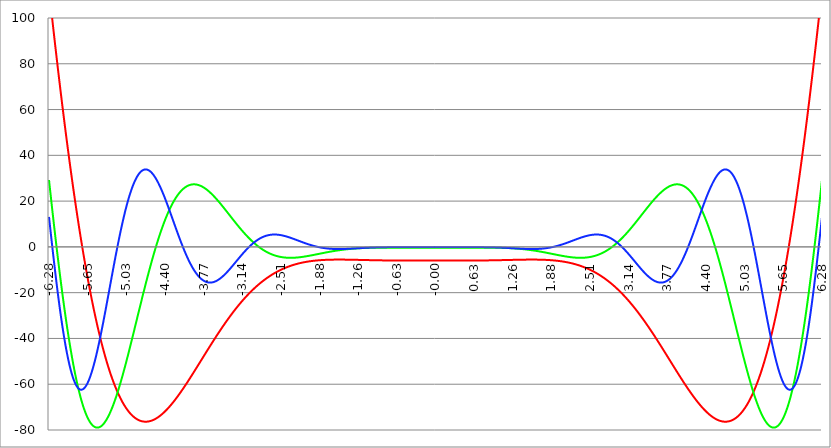
| Category | Series 1 | Series 0 | Series 2 |
|---|---|---|---|
| -6.283185307179586 | 112.435 | 29.234 | 13.085 |
| -6.276902121872407 | 110.879 | 27.678 | 11.529 |
| -6.270618936565228 | 109.328 | 26.126 | 9.978 |
| -6.264335751258049 | 107.781 | 24.58 | 8.433 |
| -6.25805256595087 | 106.239 | 23.04 | 6.894 |
| -6.25176938064369 | 104.702 | 21.504 | 5.362 |
| -6.245486195336511 | 103.17 | 19.975 | 3.838 |
| -6.23920301002933 | 101.643 | 18.452 | 2.321 |
| -6.232919824722153 | 100.121 | 16.935 | 0.812 |
| -6.226636639414973 | 98.604 | 15.424 | -0.687 |
| -6.220353454107794 | 97.092 | 13.921 | -2.178 |
| -6.214070268800615 | 95.585 | 12.424 | -3.658 |
| -6.207787083493435 | 94.084 | 10.934 | -5.128 |
| -6.201503898186257 | 92.588 | 9.452 | -6.588 |
| -6.195220712879077 | 91.097 | 7.977 | -8.036 |
| -6.188937527571898 | 89.611 | 6.51 | -9.472 |
| -6.182654342264719 | 88.131 | 5.051 | -10.896 |
| -6.17637115695754 | 86.656 | 3.6 | -12.308 |
| -6.170087971650361 | 85.187 | 2.157 | -13.706 |
| -6.163804786343182 | 83.724 | 0.724 | -15.091 |
| -6.157521601036002 | 82.265 | -0.702 | -16.462 |
| -6.151238415728823 | 80.813 | -2.118 | -17.819 |
| -6.144955230421644 | 79.366 | -3.525 | -19.161 |
| -6.138672045114464 | 77.925 | -4.923 | -20.487 |
| -6.132388859807286 | 76.489 | -6.312 | -21.798 |
| -6.126105674500106 | 75.06 | -7.69 | -23.094 |
| -6.119822489192927 | 73.636 | -9.059 | -24.373 |
| -6.113539303885748 | 72.218 | -10.418 | -25.635 |
| -6.107256118578569 | 70.806 | -11.767 | -26.88 |
| -6.10097293327139 | 69.4 | -13.105 | -28.108 |
| -6.09468974796421 | 67.999 | -14.433 | -29.318 |
| -6.088406562657031 | 66.605 | -15.75 | -30.51 |
| -6.082123377349852 | 65.217 | -17.057 | -31.683 |
| -6.075840192042672 | 63.835 | -18.352 | -32.838 |
| -6.069557006735494 | 62.459 | -19.636 | -33.974 |
| -6.063273821428314 | 61.089 | -20.909 | -35.09 |
| -6.056990636121135 | 59.725 | -22.171 | -36.187 |
| -6.050707450813956 | 58.368 | -23.421 | -37.264 |
| -6.044424265506777 | 57.016 | -24.659 | -38.32 |
| -6.038141080199597 | 55.671 | -25.885 | -39.357 |
| -6.031857894892418 | 54.332 | -27.1 | -40.372 |
| -6.025574709585239 | 53 | -28.302 | -41.367 |
| -6.01929152427806 | 51.674 | -29.492 | -42.34 |
| -6.013008338970881 | 50.354 | -30.669 | -43.293 |
| -6.006725153663701 | 49.041 | -31.835 | -44.223 |
| -6.000441968356522 | 47.734 | -32.987 | -45.132 |
| -5.994158783049343 | 46.434 | -34.127 | -46.018 |
| -5.987875597742164 | 45.14 | -35.254 | -46.883 |
| -5.981592412434984 | 43.853 | -36.368 | -47.725 |
| -5.975309227127805 | 42.572 | -37.469 | -48.545 |
| -5.969026041820626 | 41.298 | -38.556 | -49.341 |
| -5.962742856513447 | 40.03 | -39.631 | -50.115 |
| -5.956459671206268 | 38.769 | -40.692 | -50.866 |
| -5.950176485899088 | 37.515 | -41.739 | -51.594 |
| -5.94389330059191 | 36.268 | -42.773 | -52.299 |
| -5.93761011528473 | 35.027 | -43.793 | -52.98 |
| -5.931326929977551 | 33.793 | -44.8 | -53.638 |
| -5.925043744670372 | 32.565 | -45.793 | -54.272 |
| -5.918760559363193 | 31.345 | -46.771 | -54.883 |
| -5.912477374056014 | 30.131 | -47.736 | -55.47 |
| -5.906194188748834 | 28.924 | -48.687 | -56.033 |
| -5.899911003441655 | 27.724 | -49.624 | -56.572 |
| -5.893627818134476 | 26.53 | -50.546 | -57.087 |
| -5.887344632827297 | 25.344 | -51.454 | -57.579 |
| -5.881061447520117 | 24.164 | -52.348 | -58.046 |
| -5.874778262212938 | 22.992 | -53.227 | -58.49 |
| -5.868495076905759 | 21.826 | -54.092 | -58.909 |
| -5.86221189159858 | 20.667 | -54.942 | -59.305 |
| -5.855928706291401 | 19.515 | -55.778 | -59.676 |
| -5.849645520984221 | 18.371 | -56.599 | -60.024 |
| -5.843362335677042 | 17.233 | -57.405 | -60.348 |
| -5.837079150369863 | 16.102 | -58.197 | -60.648 |
| -5.830795965062684 | 14.978 | -58.974 | -60.924 |
| -5.824512779755505 | 13.861 | -59.736 | -61.176 |
| -5.818229594448325 | 12.752 | -60.484 | -61.404 |
| -5.811946409141146 | 11.649 | -61.216 | -61.609 |
| -5.805663223833967 | 10.554 | -61.934 | -61.79 |
| -5.799380038526788 | 9.465 | -62.636 | -61.948 |
| -5.793096853219609 | 8.384 | -63.324 | -62.082 |
| -5.78681366791243 | 7.31 | -63.997 | -62.193 |
| -5.780530482605251 | 6.243 | -64.655 | -62.281 |
| -5.774247297298071 | 5.183 | -65.297 | -62.345 |
| -5.767964111990892 | 4.13 | -65.925 | -62.387 |
| -5.761680926683713 | 3.084 | -66.538 | -62.406 |
| -5.755397741376534 | 2.046 | -67.136 | -62.402 |
| -5.749114556069355 | 1.014 | -67.718 | -62.376 |
| -5.742831370762175 | -0.01 | -68.286 | -62.327 |
| -5.736548185454996 | -1.026 | -68.839 | -62.257 |
| -5.730265000147816 | -2.036 | -69.376 | -62.164 |
| -5.723981814840638 | -3.039 | -69.899 | -62.049 |
| -5.717698629533459 | -4.034 | -70.407 | -61.912 |
| -5.711415444226279 | -5.022 | -70.899 | -61.755 |
| -5.7051322589191 | -6.003 | -71.377 | -61.575 |
| -5.698849073611921 | -6.976 | -71.839 | -61.375 |
| -5.692565888304742 | -7.943 | -72.287 | -61.154 |
| -5.686282702997562 | -8.902 | -72.72 | -60.912 |
| -5.679999517690383 | -9.854 | -73.137 | -60.65 |
| -5.673716332383204 | -10.798 | -73.54 | -60.368 |
| -5.667433147076025 | -11.735 | -73.928 | -60.065 |
| -5.661149961768846 | -12.666 | -74.302 | -59.743 |
| -5.654866776461667 | -13.588 | -74.66 | -59.402 |
| -5.648583591154487 | -14.504 | -75.004 | -59.041 |
| -5.642300405847308 | -15.412 | -75.333 | -58.662 |
| -5.63601722054013 | -16.313 | -75.647 | -58.263 |
| -5.62973403523295 | -17.207 | -75.947 | -57.847 |
| -5.623450849925771 | -18.094 | -76.232 | -57.412 |
| -5.617167664618591 | -18.973 | -76.503 | -56.959 |
| -5.610884479311412 | -19.845 | -76.759 | -56.489 |
| -5.604601294004233 | -20.709 | -77.001 | -56.002 |
| -5.598318108697054 | -21.567 | -77.228 | -55.497 |
| -5.592034923389875 | -22.417 | -77.441 | -54.976 |
| -5.585751738082695 | -23.26 | -77.64 | -54.439 |
| -5.579468552775516 | -24.096 | -77.824 | -53.885 |
| -5.573185367468337 | -24.924 | -77.995 | -53.316 |
| -5.566902182161157 | -25.745 | -78.151 | -52.731 |
| -5.560618996853979 | -26.559 | -78.294 | -52.132 |
| -5.5543358115468 | -27.366 | -78.422 | -51.517 |
| -5.54805262623962 | -28.166 | -78.537 | -50.888 |
| -5.54176944093244 | -28.958 | -78.637 | -50.245 |
| -5.535486255625262 | -29.743 | -78.724 | -49.588 |
| -5.529203070318083 | -30.521 | -78.798 | -48.918 |
| -5.522919885010904 | -31.292 | -78.858 | -48.234 |
| -5.516636699703724 | -32.055 | -78.904 | -47.538 |
| -5.510353514396545 | -32.811 | -78.937 | -46.829 |
| -5.504070329089366 | -33.56 | -78.957 | -46.108 |
| -5.497787143782186 | -34.302 | -78.964 | -45.376 |
| -5.491503958475008 | -35.037 | -78.957 | -44.632 |
| -5.485220773167828 | -35.764 | -78.938 | -43.877 |
| -5.47893758786065 | -36.485 | -78.905 | -43.111 |
| -5.47265440255347 | -37.198 | -78.86 | -42.335 |
| -5.466371217246291 | -37.904 | -78.802 | -41.549 |
| -5.460088031939112 | -38.603 | -78.731 | -40.754 |
| -5.453804846631932 | -39.295 | -78.648 | -39.949 |
| -5.447521661324753 | -39.98 | -78.552 | -39.135 |
| -5.441238476017574 | -40.658 | -78.444 | -38.313 |
| -5.434955290710395 | -41.328 | -78.323 | -37.483 |
| -5.428672105403215 | -41.992 | -78.191 | -36.645 |
| -5.422388920096036 | -42.648 | -78.046 | -35.799 |
| -5.416105734788857 | -43.298 | -77.89 | -34.946 |
| -5.409822549481678 | -43.94 | -77.722 | -34.087 |
| -5.403539364174499 | -44.575 | -77.542 | -33.222 |
| -5.39725617886732 | -45.204 | -77.35 | -32.35 |
| -5.39097299356014 | -45.825 | -77.147 | -31.473 |
| -5.384689808252961 | -46.44 | -76.933 | -30.59 |
| -5.378406622945782 | -47.047 | -76.707 | -29.703 |
| -5.372123437638603 | -47.648 | -76.471 | -28.811 |
| -5.365840252331424 | -48.241 | -76.223 | -27.915 |
| -5.359557067024244 | -48.828 | -75.964 | -27.015 |
| -5.353273881717065 | -49.408 | -75.695 | -26.112 |
| -5.346990696409886 | -49.981 | -75.415 | -25.205 |
| -5.340707511102707 | -50.547 | -75.124 | -24.296 |
| -5.334424325795528 | -51.106 | -74.823 | -23.385 |
| -5.328141140488348 | -51.658 | -74.512 | -22.472 |
| -5.32185795518117 | -52.204 | -74.191 | -21.557 |
| -5.31557476987399 | -52.742 | -73.859 | -20.64 |
| -5.30929158456681 | -53.274 | -73.518 | -19.723 |
| -5.303008399259631 | -53.799 | -73.167 | -18.805 |
| -5.296725213952453 | -54.318 | -72.806 | -17.887 |
| -5.290442028645273 | -54.83 | -72.436 | -16.968 |
| -5.284158843338094 | -55.335 | -72.057 | -16.051 |
| -5.277875658030915 | -55.833 | -71.668 | -15.134 |
| -5.271592472723735 | -56.325 | -71.27 | -14.218 |
| -5.265309287416557 | -56.81 | -70.863 | -13.303 |
| -5.259026102109377 | -57.288 | -70.448 | -12.391 |
| -5.252742916802198 | -57.76 | -70.023 | -11.48 |
| -5.246459731495019 | -58.225 | -69.591 | -10.572 |
| -5.24017654618784 | -58.683 | -69.149 | -9.666 |
| -5.23389336088066 | -59.135 | -68.7 | -8.764 |
| -5.227610175573481 | -59.581 | -68.242 | -7.865 |
| -5.221326990266302 | -60.02 | -67.776 | -6.969 |
| -5.215043804959122 | -60.453 | -67.303 | -6.078 |
| -5.208760619651944 | -60.879 | -66.821 | -5.191 |
| -5.202477434344764 | -61.298 | -66.332 | -4.308 |
| -5.196194249037585 | -61.712 | -65.836 | -3.43 |
| -5.189911063730406 | -62.118 | -65.332 | -2.558 |
| -5.183627878423227 | -62.519 | -64.821 | -1.69 |
| -5.177344693116048 | -62.913 | -64.303 | -0.829 |
| -5.171061507808868 | -63.301 | -63.779 | 0.026 |
| -5.164778322501689 | -63.682 | -63.247 | 0.876 |
| -5.15849513719451 | -64.058 | -62.709 | 1.718 |
| -5.152211951887331 | -64.427 | -62.164 | 2.554 |
| -5.145928766580152 | -64.789 | -61.614 | 3.383 |
| -5.139645581272972 | -65.146 | -61.056 | 4.204 |
| -5.133362395965793 | -65.496 | -60.493 | 5.018 |
| -5.127079210658614 | -65.841 | -59.924 | 5.824 |
| -5.120796025351435 | -66.179 | -59.35 | 6.622 |
| -5.114512840044256 | -66.511 | -58.769 | 7.412 |
| -5.108229654737076 | -66.837 | -58.183 | 8.193 |
| -5.101946469429897 | -67.157 | -57.592 | 8.965 |
| -5.095663284122718 | -67.471 | -56.996 | 9.728 |
| -5.08938009881554 | -67.778 | -56.395 | 10.483 |
| -5.08309691350836 | -68.08 | -55.789 | 11.227 |
| -5.07681372820118 | -68.376 | -55.178 | 11.962 |
| -5.070530542894002 | -68.666 | -54.562 | 12.688 |
| -5.064247357586822 | -68.951 | -53.942 | 13.403 |
| -5.057964172279643 | -69.229 | -53.318 | 14.108 |
| -5.051680986972464 | -69.501 | -52.689 | 14.802 |
| -5.045397801665285 | -69.768 | -52.057 | 15.486 |
| -5.039114616358106 | -70.029 | -51.42 | 16.16 |
| -5.032831431050926 | -70.284 | -50.78 | 16.822 |
| -5.026548245743747 | -70.534 | -50.136 | 17.473 |
| -5.020265060436568 | -70.777 | -49.489 | 18.113 |
| -5.013981875129389 | -71.016 | -48.838 | 18.741 |
| -5.00769868982221 | -71.248 | -48.184 | 19.358 |
| -5.00141550451503 | -71.475 | -47.528 | 19.964 |
| -4.995132319207851 | -71.696 | -46.868 | 20.557 |
| -4.98884913390067 | -71.912 | -46.205 | 21.138 |
| -4.982565948593493 | -72.122 | -45.54 | 21.708 |
| -4.976282763286313 | -72.327 | -44.872 | 22.265 |
| -4.969999577979134 | -72.526 | -44.202 | 22.81 |
| -4.963716392671955 | -72.72 | -43.53 | 23.342 |
| -4.957433207364776 | -72.908 | -42.856 | 23.862 |
| -4.951150022057597 | -73.091 | -42.179 | 24.369 |
| -4.944866836750418 | -73.269 | -41.501 | 24.863 |
| -4.938583651443238 | -73.441 | -40.821 | 25.344 |
| -4.932300466136059 | -73.608 | -40.14 | 25.813 |
| -4.92601728082888 | -73.77 | -39.457 | 26.269 |
| -4.9197340955217 | -73.927 | -38.773 | 26.711 |
| -4.913450910214521 | -74.078 | -38.087 | 27.14 |
| -4.907167724907342 | -74.224 | -37.401 | 27.557 |
| -4.900884539600163 | -74.366 | -36.714 | 27.96 |
| -4.894601354292984 | -74.502 | -36.026 | 28.349 |
| -4.888318168985805 | -74.633 | -35.337 | 28.726 |
| -4.882034983678625 | -74.759 | -34.648 | 29.088 |
| -4.875751798371446 | -74.879 | -33.958 | 29.438 |
| -4.869468613064267 | -74.995 | -33.268 | 29.774 |
| -4.863185427757088 | -75.106 | -32.578 | 30.097 |
| -4.856902242449909 | -75.213 | -31.888 | 30.406 |
| -4.85061905714273 | -75.314 | -31.198 | 30.702 |
| -4.84433587183555 | -75.41 | -30.509 | 30.984 |
| -4.838052686528371 | -75.502 | -29.819 | 31.252 |
| -4.831769501221192 | -75.589 | -29.13 | 31.508 |
| -4.825486315914013 | -75.671 | -28.442 | 31.749 |
| -4.819203130606833 | -75.748 | -27.754 | 31.978 |
| -4.812919945299654 | -75.821 | -27.067 | 32.192 |
| -4.806636759992475 | -75.889 | -26.382 | 32.394 |
| -4.800353574685296 | -75.952 | -25.697 | 32.582 |
| -4.794070389378117 | -76.011 | -25.013 | 32.756 |
| -4.787787204070938 | -76.065 | -24.331 | 32.918 |
| -4.781504018763758 | -76.115 | -23.649 | 33.066 |
| -4.77522083345658 | -76.16 | -22.97 | 33.2 |
| -4.7689376481494 | -76.201 | -22.292 | 33.322 |
| -4.762654462842221 | -76.237 | -21.616 | 33.431 |
| -4.756371277535042 | -76.269 | -20.941 | 33.526 |
| -4.750088092227862 | -76.296 | -20.269 | 33.608 |
| -4.743804906920683 | -76.32 | -19.598 | 33.678 |
| -4.737521721613504 | -76.338 | -18.93 | 33.735 |
| -4.731238536306324 | -76.353 | -18.264 | 33.779 |
| -4.724955350999146 | -76.364 | -17.6 | 33.81 |
| -4.718672165691966 | -76.37 | -16.939 | 33.829 |
| -4.712388980384787 | -76.372 | -16.28 | 33.835 |
| -4.706105795077608 | -76.37 | -15.624 | 33.829 |
| -4.699822609770429 | -76.364 | -14.97 | 33.81 |
| -4.69353942446325 | -76.353 | -14.32 | 33.78 |
| -4.68725623915607 | -76.339 | -13.672 | 33.737 |
| -4.680973053848891 | -76.321 | -13.027 | 33.682 |
| -4.674689868541712 | -76.299 | -12.386 | 33.616 |
| -4.668406683234533 | -76.273 | -11.747 | 33.537 |
| -4.662123497927354 | -76.242 | -11.112 | 33.447 |
| -4.655840312620174 | -76.209 | -10.48 | 33.346 |
| -4.649557127312995 | -76.171 | -9.852 | 33.233 |
| -4.643273942005816 | -76.129 | -9.227 | 33.109 |
| -4.636990756698637 | -76.084 | -8.606 | 32.974 |
| -4.630707571391458 | -76.035 | -7.988 | 32.828 |
| -4.624424386084279 | -75.982 | -7.375 | 32.672 |
| -4.618141200777099 | -75.926 | -6.765 | 32.504 |
| -4.61185801546992 | -75.866 | -6.159 | 32.326 |
| -4.605574830162741 | -75.802 | -5.557 | 32.138 |
| -4.599291644855561 | -75.735 | -4.959 | 31.94 |
| -4.593008459548383 | -75.664 | -4.366 | 31.731 |
| -4.586725274241203 | -75.59 | -3.776 | 31.513 |
| -4.580442088934024 | -75.512 | -3.191 | 31.285 |
| -4.574158903626845 | -75.431 | -2.611 | 31.047 |
| -4.567875718319666 | -75.346 | -2.034 | 30.801 |
| -4.561592533012487 | -75.258 | -1.463 | 30.544 |
| -4.555309347705307 | -75.167 | -0.895 | 30.279 |
| -4.549026162398128 | -75.073 | -0.333 | 30.005 |
| -4.542742977090949 | -74.975 | 0.225 | 29.722 |
| -4.53645979178377 | -74.874 | 0.778 | 29.431 |
| -4.530176606476591 | -74.77 | 1.326 | 29.132 |
| -4.523893421169412 | -74.662 | 1.87 | 28.824 |
| -4.517610235862232 | -74.552 | 2.408 | 28.508 |
| -4.511327050555053 | -74.438 | 2.941 | 28.185 |
| -4.505043865247874 | -74.321 | 3.47 | 27.854 |
| -4.498760679940694 | -74.201 | 3.993 | 27.515 |
| -4.492477494633515 | -74.079 | 4.511 | 27.17 |
| -4.486194309326336 | -73.953 | 5.024 | 26.817 |
| -4.479911124019157 | -73.824 | 5.531 | 26.458 |
| -4.473627938711977 | -73.692 | 6.034 | 26.092 |
| -4.467344753404799 | -73.558 | 6.531 | 25.719 |
| -4.46106156809762 | -73.421 | 7.022 | 25.34 |
| -4.45477838279044 | -73.281 | 7.508 | 24.955 |
| -4.44849519748326 | -73.138 | 7.989 | 24.565 |
| -4.442212012176082 | -72.992 | 8.464 | 24.168 |
| -4.435928826868903 | -72.844 | 8.934 | 23.767 |
| -4.429645641561723 | -72.693 | 9.397 | 23.359 |
| -4.423362456254544 | -72.539 | 9.856 | 22.947 |
| -4.417079270947365 | -72.383 | 10.308 | 22.53 |
| -4.410796085640185 | -72.224 | 10.755 | 22.109 |
| -4.404512900333007 | -72.062 | 11.196 | 21.682 |
| -4.398229715025827 | -71.898 | 11.632 | 21.252 |
| -4.391946529718648 | -71.732 | 12.061 | 20.818 |
| -4.38566334441147 | -71.563 | 12.485 | 20.379 |
| -4.37938015910429 | -71.392 | 12.903 | 19.937 |
| -4.373096973797111 | -71.218 | 13.315 | 19.492 |
| -4.366813788489932 | -71.042 | 13.721 | 19.043 |
| -4.360530603182752 | -70.864 | 14.121 | 18.591 |
| -4.354247417875573 | -70.683 | 14.515 | 18.136 |
| -4.347964232568394 | -70.5 | 14.904 | 17.679 |
| -4.341681047261215 | -70.315 | 15.286 | 17.219 |
| -4.335397861954035 | -70.127 | 15.662 | 16.757 |
| -4.329114676646856 | -69.938 | 16.032 | 16.293 |
| -4.322831491339677 | -69.746 | 16.397 | 15.826 |
| -4.316548306032498 | -69.552 | 16.755 | 15.358 |
| -4.310265120725319 | -69.356 | 17.107 | 14.889 |
| -4.30398193541814 | -69.159 | 17.453 | 14.418 |
| -4.29769875011096 | -68.959 | 17.793 | 13.946 |
| -4.291415564803781 | -68.757 | 18.126 | 13.474 |
| -4.285132379496602 | -68.553 | 18.454 | 13 |
| -4.278849194189422 | -68.347 | 18.776 | 12.526 |
| -4.272566008882244 | -68.139 | 19.091 | 12.051 |
| -4.266282823575064 | -67.93 | 19.4 | 11.577 |
| -4.259999638267885 | -67.718 | 19.703 | 11.102 |
| -4.253716452960706 | -67.505 | 20.001 | 10.627 |
| -4.247433267653527 | -67.29 | 20.291 | 10.153 |
| -4.241150082346347 | -67.073 | 20.576 | 9.679 |
| -4.234866897039168 | -66.855 | 20.855 | 9.206 |
| -4.228583711731989 | -66.635 | 21.128 | 8.734 |
| -4.22230052642481 | -66.413 | 21.394 | 8.263 |
| -4.216017341117631 | -66.189 | 21.654 | 7.793 |
| -4.209734155810452 | -65.964 | 21.909 | 7.324 |
| -4.203450970503273 | -65.738 | 22.157 | 6.857 |
| -4.197167785196093 | -65.51 | 22.399 | 6.392 |
| -4.190884599888914 | -65.28 | 22.635 | 5.929 |
| -4.184601414581734 | -65.049 | 22.865 | 5.467 |
| -4.178318229274556 | -64.816 | 23.088 | 5.008 |
| -4.172035043967377 | -64.582 | 23.306 | 4.551 |
| -4.165751858660197 | -64.347 | 23.518 | 4.097 |
| -4.159468673353018 | -64.11 | 23.724 | 3.645 |
| -4.153185488045839 | -63.872 | 23.923 | 3.196 |
| -4.14690230273866 | -63.632 | 24.117 | 2.75 |
| -4.140619117431481 | -63.392 | 24.305 | 2.307 |
| -4.134335932124301 | -63.15 | 24.487 | 1.867 |
| -4.128052746817122 | -62.906 | 24.663 | 1.431 |
| -4.121769561509943 | -62.662 | 24.833 | 0.998 |
| -4.115486376202764 | -62.416 | 24.997 | 0.568 |
| -4.109203190895584 | -62.17 | 25.155 | 0.143 |
| -4.102920005588405 | -61.922 | 25.308 | -0.279 |
| -4.096636820281226 | -61.673 | 25.454 | -0.696 |
| -4.090353634974047 | -61.423 | 25.595 | -1.11 |
| -4.084070449666868 | -61.172 | 25.73 | -1.519 |
| -4.077787264359689 | -60.92 | 25.86 | -1.924 |
| -4.071504079052509 | -60.667 | 25.984 | -2.324 |
| -4.06522089374533 | -60.413 | 26.102 | -2.72 |
| -4.058937708438151 | -60.158 | 26.214 | -3.111 |
| -4.052654523130972 | -59.902 | 26.321 | -3.497 |
| -4.046371337823793 | -59.645 | 26.422 | -3.879 |
| -4.040088152516613 | -59.387 | 26.518 | -4.255 |
| -4.033804967209434 | -59.129 | 26.608 | -4.626 |
| -4.027521781902255 | -58.87 | 26.693 | -4.992 |
| -4.021238596595076 | -58.61 | 26.772 | -5.353 |
| -4.014955411287897 | -58.349 | 26.846 | -5.708 |
| -4.008672225980717 | -58.087 | 26.914 | -6.058 |
| -4.002389040673538 | -57.825 | 26.977 | -6.402 |
| -3.996105855366359 | -57.562 | 27.035 | -6.741 |
| -3.989822670059179 | -57.299 | 27.088 | -7.074 |
| -3.983539484752 | -57.034 | 27.135 | -7.401 |
| -3.97725629944482 | -56.769 | 27.177 | -7.722 |
| -3.97097311413764 | -56.504 | 27.215 | -8.038 |
| -3.96468992883046 | -56.238 | 27.247 | -8.347 |
| -3.958406743523281 | -55.972 | 27.274 | -8.651 |
| -3.952123558216101 | -55.705 | 27.296 | -8.948 |
| -3.945840372908922 | -55.437 | 27.313 | -9.239 |
| -3.939557187601742 | -55.169 | 27.325 | -9.524 |
| -3.933274002294562 | -54.901 | 27.332 | -9.802 |
| -3.926990816987382 | -54.632 | 27.334 | -10.074 |
| -3.920707631680203 | -54.362 | 27.332 | -10.34 |
| -3.914424446373023 | -54.093 | 27.325 | -10.6 |
| -3.908141261065844 | -53.823 | 27.313 | -10.853 |
| -3.901858075758664 | -53.553 | 27.297 | -11.099 |
| -3.895574890451484 | -53.282 | 27.276 | -11.339 |
| -3.889291705144305 | -53.011 | 27.25 | -11.573 |
| -3.883008519837125 | -52.74 | 27.22 | -11.8 |
| -3.876725334529945 | -52.468 | 27.185 | -12.02 |
| -3.870442149222766 | -52.197 | 27.146 | -12.234 |
| -3.864158963915586 | -51.925 | 27.103 | -12.441 |
| -3.857875778608407 | -51.653 | 27.056 | -12.641 |
| -3.851592593301227 | -51.381 | 27.004 | -12.835 |
| -3.845309407994047 | -51.108 | 26.948 | -13.022 |
| -3.839026222686868 | -50.836 | 26.888 | -13.203 |
| -3.832743037379688 | -50.563 | 26.823 | -13.376 |
| -3.826459852072508 | -50.291 | 26.755 | -13.544 |
| -3.820176666765329 | -50.018 | 26.683 | -13.704 |
| -3.813893481458149 | -49.745 | 26.606 | -13.858 |
| -3.807610296150969 | -49.473 | 26.526 | -14.005 |
| -3.80132711084379 | -49.2 | 26.442 | -14.145 |
| -3.79504392553661 | -48.927 | 26.355 | -14.279 |
| -3.78876074022943 | -48.655 | 26.263 | -14.406 |
| -3.782477554922251 | -48.382 | 26.168 | -14.526 |
| -3.776194369615071 | -48.11 | 26.069 | -14.64 |
| -3.769911184307892 | -47.837 | 25.967 | -14.748 |
| -3.763627999000712 | -47.565 | 25.861 | -14.848 |
| -3.757344813693532 | -47.293 | 25.752 | -14.943 |
| -3.751061628386352 | -47.021 | 25.64 | -15.03 |
| -3.744778443079173 | -46.749 | 25.524 | -15.112 |
| -3.738495257771993 | -46.477 | 25.404 | -15.186 |
| -3.732212072464814 | -46.206 | 25.282 | -15.255 |
| -3.725928887157634 | -45.935 | 25.156 | -15.317 |
| -3.719645701850454 | -45.664 | 25.028 | -15.373 |
| -3.713362516543275 | -45.393 | 24.896 | -15.422 |
| -3.707079331236095 | -45.123 | 24.761 | -15.465 |
| -3.700796145928915 | -44.852 | 24.623 | -15.502 |
| -3.694512960621736 | -44.583 | 24.483 | -15.533 |
| -3.688229775314556 | -44.313 | 24.339 | -15.558 |
| -3.681946590007376 | -44.044 | 24.193 | -15.577 |
| -3.675663404700197 | -43.775 | 24.044 | -15.59 |
| -3.669380219393017 | -43.507 | 23.892 | -15.596 |
| -3.663097034085838 | -43.239 | 23.738 | -15.597 |
| -3.656813848778658 | -42.971 | 23.581 | -15.593 |
| -3.650530663471478 | -42.704 | 23.422 | -15.582 |
| -3.644247478164299 | -42.438 | 23.26 | -15.566 |
| -3.63796429285712 | -42.171 | 23.096 | -15.544 |
| -3.631681107549939 | -41.906 | 22.93 | -15.516 |
| -3.62539792224276 | -41.64 | 22.761 | -15.483 |
| -3.61911473693558 | -41.375 | 22.59 | -15.445 |
| -3.612831551628401 | -41.111 | 22.417 | -15.401 |
| -3.606548366321221 | -40.847 | 22.242 | -15.352 |
| -3.600265181014041 | -40.584 | 22.064 | -15.298 |
| -3.593981995706862 | -40.322 | 21.885 | -15.239 |
| -3.587698810399682 | -40.06 | 21.704 | -15.175 |
| -3.581415625092502 | -39.798 | 21.521 | -15.105 |
| -3.575132439785323 | -39.537 | 21.336 | -15.031 |
| -3.568849254478143 | -39.277 | 21.149 | -14.952 |
| -3.562566069170964 | -39.017 | 20.961 | -14.868 |
| -3.556282883863784 | -38.758 | 20.771 | -14.78 |
| -3.549999698556604 | -38.5 | 20.579 | -14.687 |
| -3.543716513249425 | -38.243 | 20.386 | -14.59 |
| -3.537433327942245 | -37.986 | 20.191 | -14.488 |
| -3.531150142635065 | -37.729 | 19.995 | -14.382 |
| -3.524866957327886 | -37.474 | 19.798 | -14.271 |
| -3.518583772020706 | -37.219 | 19.599 | -14.157 |
| -3.512300586713526 | -36.965 | 19.399 | -14.038 |
| -3.506017401406347 | -36.711 | 19.197 | -13.916 |
| -3.499734216099167 | -36.459 | 18.995 | -13.789 |
| -3.493451030791987 | -36.207 | 18.791 | -13.659 |
| -3.487167845484808 | -35.956 | 18.586 | -13.525 |
| -3.480884660177628 | -35.706 | 18.38 | -13.388 |
| -3.474601474870449 | -35.456 | 18.174 | -13.247 |
| -3.468318289563269 | -35.207 | 17.966 | -13.103 |
| -3.462035104256089 | -34.959 | 17.757 | -12.955 |
| -3.45575191894891 | -34.712 | 17.548 | -12.804 |
| -3.44946873364173 | -34.466 | 17.338 | -12.65 |
| -3.44318554833455 | -34.221 | 17.127 | -12.493 |
| -3.436902363027371 | -33.976 | 16.915 | -12.333 |
| -3.430619177720191 | -33.733 | 16.703 | -12.171 |
| -3.424335992413011 | -33.49 | 16.491 | -12.005 |
| -3.418052807105832 | -33.248 | 16.277 | -11.837 |
| -3.411769621798652 | -33.007 | 16.064 | -11.666 |
| -3.405486436491473 | -32.767 | 15.849 | -11.493 |
| -3.399203251184293 | -32.528 | 15.635 | -11.318 |
| -3.392920065877113 | -32.29 | 15.42 | -11.14 |
| -3.386636880569934 | -32.053 | 15.205 | -10.96 |
| -3.380353695262754 | -31.817 | 14.989 | -10.778 |
| -3.374070509955574 | -31.581 | 14.774 | -10.594 |
| -3.367787324648395 | -31.347 | 14.558 | -10.408 |
| -3.361504139341215 | -31.113 | 14.342 | -10.22 |
| -3.355220954034035 | -30.881 | 14.126 | -10.031 |
| -3.348937768726855 | -30.65 | 13.91 | -9.84 |
| -3.342654583419676 | -30.419 | 13.694 | -9.647 |
| -3.336371398112496 | -30.19 | 13.478 | -9.453 |
| -3.330088212805317 | -29.961 | 13.262 | -9.258 |
| -3.323805027498137 | -29.734 | 13.047 | -9.061 |
| -3.317521842190957 | -29.507 | 12.831 | -8.864 |
| -3.311238656883778 | -29.282 | 12.616 | -8.665 |
| -3.304955471576598 | -29.058 | 12.401 | -8.465 |
| -3.298672286269419 | -28.835 | 12.186 | -8.265 |
| -3.292389100962239 | -28.612 | 11.972 | -8.063 |
| -3.286105915655059 | -28.391 | 11.758 | -7.861 |
| -3.27982273034788 | -28.171 | 11.545 | -7.659 |
| -3.2735395450407 | -27.952 | 11.331 | -7.456 |
| -3.26725635973352 | -27.734 | 11.119 | -7.252 |
| -3.260973174426341 | -27.517 | 10.907 | -7.048 |
| -3.254689989119161 | -27.301 | 10.696 | -6.844 |
| -3.248406803811982 | -27.087 | 10.485 | -6.64 |
| -3.242123618504802 | -26.873 | 10.275 | -6.435 |
| -3.235840433197622 | -26.661 | 10.065 | -6.231 |
| -3.229557247890442 | -26.449 | 9.856 | -6.026 |
| -3.223274062583263 | -26.239 | 9.648 | -5.822 |
| -3.216990877276083 | -26.03 | 9.441 | -5.618 |
| -3.210707691968904 | -25.822 | 9.235 | -5.414 |
| -3.204424506661724 | -25.615 | 9.029 | -5.211 |
| -3.198141321354544 | -25.409 | 8.825 | -5.008 |
| -3.191858136047365 | -25.204 | 8.621 | -4.806 |
| -3.185574950740185 | -25.001 | 8.418 | -4.604 |
| -3.179291765433005 | -24.799 | 8.216 | -4.403 |
| -3.173008580125826 | -24.597 | 8.015 | -4.203 |
| -3.166725394818646 | -24.397 | 7.816 | -4.004 |
| -3.160442209511467 | -24.199 | 7.617 | -3.805 |
| -3.154159024204287 | -24.001 | 7.419 | -3.608 |
| -3.147875838897107 | -23.804 | 7.223 | -3.411 |
| -3.141592653589928 | -23.609 | 7.027 | -3.216 |
| -3.135309468282748 | -23.415 | 6.833 | -3.022 |
| -3.129026282975568 | -23.222 | 6.64 | -2.829 |
| -3.122743097668389 | -23.03 | 6.448 | -2.637 |
| -3.116459912361209 | -22.839 | 6.258 | -2.447 |
| -3.110176727054029 | -22.649 | 6.068 | -2.258 |
| -3.10389354174685 | -22.461 | 5.88 | -2.07 |
| -3.09761035643967 | -22.274 | 5.694 | -1.884 |
| -3.09132717113249 | -22.088 | 5.508 | -1.7 |
| -3.085043985825311 | -21.903 | 5.324 | -1.517 |
| -3.078760800518131 | -21.72 | 5.142 | -1.336 |
| -3.072477615210952 | -21.537 | 4.96 | -1.157 |
| -3.066194429903772 | -21.356 | 4.781 | -0.98 |
| -3.059911244596592 | -21.176 | 4.602 | -0.804 |
| -3.053628059289413 | -20.997 | 4.425 | -0.63 |
| -3.047344873982233 | -20.819 | 4.25 | -0.459 |
| -3.041061688675053 | -20.643 | 4.076 | -0.289 |
| -3.034778503367874 | -20.468 | 3.904 | -0.121 |
| -3.028495318060694 | -20.294 | 3.733 | 0.044 |
| -3.022212132753515 | -20.121 | 3.564 | 0.208 |
| -3.015928947446335 | -19.949 | 3.396 | 0.369 |
| -3.009645762139155 | -19.779 | 3.23 | 0.528 |
| -3.003362576831975 | -19.61 | 3.065 | 0.685 |
| -2.997079391524796 | -19.442 | 2.902 | 0.84 |
| -2.990796206217616 | -19.275 | 2.741 | 0.992 |
| -2.984513020910436 | -19.109 | 2.581 | 1.142 |
| -2.978229835603257 | -18.945 | 2.423 | 1.29 |
| -2.971946650296077 | -18.782 | 2.267 | 1.435 |
| -2.965663464988898 | -18.62 | 2.112 | 1.578 |
| -2.959380279681718 | -18.459 | 1.959 | 1.718 |
| -2.953097094374538 | -18.3 | 1.808 | 1.856 |
| -2.946813909067359 | -18.141 | 1.658 | 1.992 |
| -2.94053072376018 | -17.984 | 1.51 | 2.124 |
| -2.934247538453 | -17.828 | 1.364 | 2.255 |
| -2.92796435314582 | -17.674 | 1.22 | 2.382 |
| -2.92168116783864 | -17.52 | 1.077 | 2.508 |
| -2.915397982531461 | -17.368 | 0.936 | 2.63 |
| -2.909114797224281 | -17.217 | 0.797 | 2.75 |
| -2.902831611917101 | -17.067 | 0.66 | 2.867 |
| -2.896548426609922 | -16.918 | 0.524 | 2.982 |
| -2.890265241302742 | -16.77 | 0.39 | 3.094 |
| -2.883982055995562 | -16.624 | 0.258 | 3.203 |
| -2.877698870688383 | -16.479 | 0.128 | 3.31 |
| -2.871415685381203 | -16.335 | -0.001 | 3.413 |
| -2.865132500074023 | -16.192 | -0.127 | 3.515 |
| -2.858849314766844 | -16.051 | -0.252 | 3.613 |
| -2.852566129459664 | -15.91 | -0.375 | 3.709 |
| -2.846282944152485 | -15.771 | -0.496 | 3.802 |
| -2.839999758845305 | -15.633 | -0.616 | 3.892 |
| -2.833716573538125 | -15.496 | -0.733 | 3.98 |
| -2.827433388230946 | -15.36 | -0.849 | 4.064 |
| -2.821150202923766 | -15.226 | -0.963 | 4.147 |
| -2.814867017616586 | -15.093 | -1.075 | 4.226 |
| -2.808583832309407 | -14.961 | -1.186 | 4.303 |
| -2.802300647002227 | -14.83 | -1.294 | 4.377 |
| -2.796017461695047 | -14.7 | -1.401 | 4.448 |
| -2.789734276387867 | -14.571 | -1.506 | 4.516 |
| -2.783451091080688 | -14.444 | -1.609 | 4.582 |
| -2.777167905773509 | -14.317 | -1.71 | 4.646 |
| -2.770884720466329 | -14.192 | -1.81 | 4.706 |
| -2.764601535159149 | -14.068 | -1.908 | 4.764 |
| -2.75831834985197 | -13.945 | -2.003 | 4.819 |
| -2.75203516454479 | -13.824 | -2.098 | 4.872 |
| -2.74575197923761 | -13.703 | -2.19 | 4.922 |
| -2.739468793930431 | -13.584 | -2.28 | 4.969 |
| -2.733185608623251 | -13.465 | -2.369 | 5.014 |
| -2.726902423316071 | -13.348 | -2.456 | 5.056 |
| -2.720619238008892 | -13.232 | -2.541 | 5.095 |
| -2.714336052701712 | -13.117 | -2.624 | 5.133 |
| -2.708052867394532 | -13.003 | -2.706 | 5.167 |
| -2.701769682087352 | -12.891 | -2.786 | 5.199 |
| -2.695486496780173 | -12.779 | -2.864 | 5.229 |
| -2.689203311472993 | -12.669 | -2.94 | 5.256 |
| -2.682920126165814 | -12.559 | -3.015 | 5.281 |
| -2.676636940858634 | -12.451 | -3.088 | 5.303 |
| -2.670353755551454 | -12.344 | -3.159 | 5.323 |
| -2.664070570244275 | -12.238 | -3.229 | 5.34 |
| -2.657787384937095 | -12.133 | -3.296 | 5.355 |
| -2.651504199629916 | -12.029 | -3.362 | 5.368 |
| -2.645221014322736 | -11.926 | -3.427 | 5.379 |
| -2.638937829015556 | -11.824 | -3.49 | 5.387 |
| -2.632654643708377 | -11.724 | -3.551 | 5.394 |
| -2.626371458401197 | -11.624 | -3.61 | 5.397 |
| -2.620088273094018 | -11.526 | -3.668 | 5.399 |
| -2.613805087786838 | -11.428 | -3.724 | 5.399 |
| -2.607521902479658 | -11.332 | -3.778 | 5.396 |
| -2.601238717172478 | -11.236 | -3.831 | 5.392 |
| -2.594955531865299 | -11.142 | -3.882 | 5.385 |
| -2.588672346558119 | -11.049 | -3.932 | 5.377 |
| -2.58238916125094 | -10.957 | -3.98 | 5.366 |
| -2.57610597594376 | -10.865 | -4.027 | 5.354 |
| -2.56982279063658 | -10.775 | -4.072 | 5.339 |
| -2.563539605329401 | -10.686 | -4.115 | 5.323 |
| -2.557256420022221 | -10.598 | -4.157 | 5.305 |
| -2.550973234715042 | -10.511 | -4.197 | 5.285 |
| -2.544690049407862 | -10.425 | -4.236 | 5.263 |
| -2.538406864100682 | -10.339 | -4.274 | 5.24 |
| -2.532123678793503 | -10.255 | -4.309 | 5.215 |
| -2.525840493486323 | -10.172 | -4.344 | 5.188 |
| -2.519557308179143 | -10.09 | -4.377 | 5.159 |
| -2.513274122871964 | -10.009 | -4.408 | 5.129 |
| -2.506990937564784 | -9.929 | -4.438 | 5.098 |
| -2.500707752257604 | -9.849 | -4.467 | 5.065 |
| -2.494424566950425 | -9.771 | -4.494 | 5.03 |
| -2.488141381643245 | -9.694 | -4.52 | 4.994 |
| -2.481858196336065 | -9.617 | -4.545 | 4.957 |
| -2.475575011028886 | -9.542 | -4.568 | 4.918 |
| -2.469291825721706 | -9.468 | -4.59 | 4.878 |
| -2.463008640414527 | -9.394 | -4.611 | 4.836 |
| -2.456725455107347 | -9.321 | -4.63 | 4.793 |
| -2.450442269800167 | -9.25 | -4.648 | 4.749 |
| -2.444159084492988 | -9.179 | -4.665 | 4.704 |
| -2.437875899185808 | -9.109 | -4.68 | 4.658 |
| -2.431592713878628 | -9.04 | -4.694 | 4.611 |
| -2.425309528571449 | -8.972 | -4.707 | 4.562 |
| -2.419026343264269 | -8.905 | -4.719 | 4.513 |
| -2.412743157957089 | -8.839 | -4.729 | 4.462 |
| -2.40645997264991 | -8.773 | -4.739 | 4.411 |
| -2.40017678734273 | -8.709 | -4.747 | 4.358 |
| -2.393893602035551 | -8.645 | -4.754 | 4.305 |
| -2.387610416728371 | -8.582 | -4.76 | 4.251 |
| -2.381327231421191 | -8.52 | -4.765 | 4.196 |
| -2.375044046114012 | -8.459 | -4.769 | 4.14 |
| -2.368760860806832 | -8.399 | -4.771 | 4.084 |
| -2.362477675499652 | -8.34 | -4.773 | 4.027 |
| -2.356194490192473 | -8.281 | -4.773 | 3.969 |
| -2.349911304885293 | -8.223 | -4.773 | 3.911 |
| -2.343628119578113 | -8.167 | -4.771 | 3.852 |
| -2.337344934270934 | -8.111 | -4.769 | 3.792 |
| -2.331061748963754 | -8.055 | -4.765 | 3.732 |
| -2.324778563656574 | -8.001 | -4.761 | 3.671 |
| -2.318495378349395 | -7.947 | -4.755 | 3.61 |
| -2.312212193042215 | -7.894 | -4.749 | 3.549 |
| -2.305929007735036 | -7.842 | -4.742 | 3.487 |
| -2.299645822427856 | -7.791 | -4.733 | 3.425 |
| -2.293362637120676 | -7.741 | -4.724 | 3.362 |
| -2.287079451813496 | -7.691 | -4.714 | 3.299 |
| -2.280796266506317 | -7.642 | -4.704 | 3.236 |
| -2.274513081199137 | -7.594 | -4.692 | 3.173 |
| -2.268229895891957 | -7.546 | -4.68 | 3.11 |
| -2.261946710584778 | -7.499 | -4.666 | 3.046 |
| -2.255663525277598 | -7.453 | -4.652 | 2.982 |
| -2.249380339970419 | -7.408 | -4.638 | 2.918 |
| -2.24309715466324 | -7.364 | -4.622 | 2.854 |
| -2.23681396935606 | -7.32 | -4.606 | 2.79 |
| -2.23053078404888 | -7.277 | -4.589 | 2.726 |
| -2.2242475987417 | -7.234 | -4.571 | 2.662 |
| -2.217964413434521 | -7.193 | -4.553 | 2.598 |
| -2.211681228127341 | -7.152 | -4.534 | 2.535 |
| -2.205398042820161 | -7.111 | -4.514 | 2.471 |
| -2.199114857512981 | -7.072 | -4.494 | 2.407 |
| -2.192831672205802 | -7.033 | -4.473 | 2.344 |
| -2.186548486898622 | -6.995 | -4.451 | 2.28 |
| -2.180265301591443 | -6.957 | -4.429 | 2.217 |
| -2.173982116284263 | -6.92 | -4.406 | 2.154 |
| -2.167698930977084 | -6.884 | -4.383 | 2.092 |
| -2.161415745669904 | -6.848 | -4.359 | 2.03 |
| -2.155132560362724 | -6.813 | -4.335 | 1.968 |
| -2.148849375055545 | -6.779 | -4.31 | 1.906 |
| -2.142566189748365 | -6.745 | -4.285 | 1.845 |
| -2.136283004441185 | -6.712 | -4.259 | 1.784 |
| -2.129999819134006 | -6.679 | -4.232 | 1.723 |
| -2.123716633826826 | -6.647 | -4.206 | 1.663 |
| -2.117433448519646 | -6.616 | -4.178 | 1.603 |
| -2.111150263212467 | -6.585 | -4.151 | 1.544 |
| -2.104867077905287 | -6.555 | -4.123 | 1.485 |
| -2.098583892598107 | -6.526 | -4.094 | 1.427 |
| -2.092300707290928 | -6.497 | -4.066 | 1.369 |
| -2.086017521983748 | -6.468 | -4.036 | 1.312 |
| -2.079734336676569 | -6.441 | -4.007 | 1.255 |
| -2.073451151369389 | -6.413 | -3.977 | 1.199 |
| -2.06716796606221 | -6.387 | -3.947 | 1.143 |
| -2.06088478075503 | -6.36 | -3.916 | 1.088 |
| -2.05460159544785 | -6.335 | -3.886 | 1.034 |
| -2.04831841014067 | -6.31 | -3.855 | 0.98 |
| -2.042035224833491 | -6.285 | -3.823 | 0.927 |
| -2.035752039526311 | -6.261 | -3.792 | 0.874 |
| -2.029468854219131 | -6.238 | -3.76 | 0.822 |
| -2.023185668911951 | -6.215 | -3.728 | 0.771 |
| -2.016902483604772 | -6.192 | -3.696 | 0.721 |
| -2.010619298297592 | -6.17 | -3.663 | 0.671 |
| -2.004336112990412 | -6.149 | -3.63 | 0.622 |
| -1.998052927683233 | -6.128 | -3.598 | 0.573 |
| -1.991769742376054 | -6.107 | -3.565 | 0.526 |
| -1.985486557068874 | -6.087 | -3.532 | 0.479 |
| -1.979203371761694 | -6.067 | -3.498 | 0.432 |
| -1.972920186454515 | -6.048 | -3.465 | 0.387 |
| -1.966637001147335 | -6.03 | -3.431 | 0.342 |
| -1.960353815840155 | -6.011 | -3.398 | 0.298 |
| -1.954070630532976 | -5.994 | -3.364 | 0.255 |
| -1.947787445225796 | -5.976 | -3.33 | 0.213 |
| -1.941504259918616 | -5.96 | -3.296 | 0.171 |
| -1.935221074611437 | -5.943 | -3.262 | 0.13 |
| -1.928937889304257 | -5.927 | -3.228 | 0.09 |
| -1.922654703997078 | -5.911 | -3.194 | 0.051 |
| -1.916371518689898 | -5.896 | -3.16 | 0.013 |
| -1.910088333382718 | -5.882 | -3.126 | -0.025 |
| -1.903805148075539 | -5.867 | -3.092 | -0.062 |
| -1.897521962768359 | -5.853 | -3.058 | -0.098 |
| -1.891238777461179 | -5.84 | -3.024 | -0.133 |
| -1.884955592154 | -5.826 | -2.99 | -0.168 |
| -1.87867240684682 | -5.814 | -2.956 | -0.201 |
| -1.87238922153964 | -5.801 | -2.922 | -0.234 |
| -1.866106036232461 | -5.789 | -2.888 | -0.266 |
| -1.859822850925281 | -5.777 | -2.854 | -0.297 |
| -1.853539665618102 | -5.766 | -2.82 | -0.328 |
| -1.847256480310922 | -5.755 | -2.786 | -0.358 |
| -1.840973295003742 | -5.744 | -2.753 | -0.386 |
| -1.834690109696563 | -5.734 | -2.719 | -0.414 |
| -1.828406924389383 | -5.724 | -2.686 | -0.442 |
| -1.822123739082203 | -5.715 | -2.652 | -0.468 |
| -1.815840553775024 | -5.705 | -2.619 | -0.494 |
| -1.809557368467844 | -5.696 | -2.586 | -0.518 |
| -1.803274183160664 | -5.688 | -2.553 | -0.542 |
| -1.796990997853485 | -5.679 | -2.52 | -0.566 |
| -1.790707812546305 | -5.671 | -2.487 | -0.588 |
| -1.784424627239125 | -5.664 | -2.455 | -0.61 |
| -1.778141441931946 | -5.656 | -2.422 | -0.631 |
| -1.771858256624766 | -5.649 | -2.39 | -0.651 |
| -1.765575071317587 | -5.642 | -2.358 | -0.671 |
| -1.759291886010407 | -5.636 | -2.326 | -0.689 |
| -1.753008700703227 | -5.629 | -2.294 | -0.707 |
| -1.746725515396048 | -5.623 | -2.263 | -0.724 |
| -1.740442330088868 | -5.618 | -2.232 | -0.741 |
| -1.734159144781688 | -5.612 | -2.2 | -0.757 |
| -1.727875959474509 | -5.607 | -2.17 | -0.772 |
| -1.72159277416733 | -5.602 | -2.139 | -0.786 |
| -1.715309588860149 | -5.597 | -2.108 | -0.8 |
| -1.70902640355297 | -5.593 | -2.078 | -0.813 |
| -1.70274321824579 | -5.589 | -2.048 | -0.825 |
| -1.69646003293861 | -5.585 | -2.018 | -0.837 |
| -1.690176847631431 | -5.581 | -1.989 | -0.848 |
| -1.683893662324251 | -5.578 | -1.959 | -0.858 |
| -1.677610477017072 | -5.574 | -1.93 | -0.868 |
| -1.671327291709892 | -5.571 | -1.901 | -0.877 |
| -1.665044106402712 | -5.568 | -1.873 | -0.885 |
| -1.658760921095533 | -5.566 | -1.844 | -0.893 |
| -1.652477735788353 | -5.563 | -1.816 | -0.9 |
| -1.646194550481173 | -5.561 | -1.788 | -0.907 |
| -1.639911365173994 | -5.559 | -1.761 | -0.913 |
| -1.633628179866814 | -5.557 | -1.733 | -0.918 |
| -1.627344994559634 | -5.556 | -1.706 | -0.923 |
| -1.621061809252455 | -5.554 | -1.68 | -0.927 |
| -1.614778623945275 | -5.553 | -1.653 | -0.931 |
| -1.608495438638096 | -5.552 | -1.627 | -0.934 |
| -1.602212253330916 | -5.551 | -1.601 | -0.937 |
| -1.595929068023736 | -5.55 | -1.575 | -0.939 |
| -1.589645882716557 | -5.55 | -1.55 | -0.941 |
| -1.583362697409377 | -5.549 | -1.525 | -0.942 |
| -1.577079512102197 | -5.549 | -1.5 | -0.943 |
| -1.570796326795018 | -5.549 | -1.476 | -0.943 |
| -1.564513141487838 | -5.549 | -1.451 | -0.943 |
| -1.558229956180659 | -5.549 | -1.427 | -0.942 |
| -1.551946770873479 | -5.55 | -1.404 | -0.941 |
| -1.545663585566299 | -5.55 | -1.38 | -0.939 |
| -1.53938040025912 | -5.551 | -1.357 | -0.937 |
| -1.53309721495194 | -5.552 | -1.335 | -0.935 |
| -1.52681402964476 | -5.553 | -1.312 | -0.932 |
| -1.520530844337581 | -5.554 | -1.29 | -0.929 |
| -1.514247659030401 | -5.555 | -1.268 | -0.926 |
| -1.507964473723221 | -5.556 | -1.247 | -0.922 |
| -1.501681288416042 | -5.557 | -1.226 | -0.918 |
| -1.495398103108862 | -5.559 | -1.205 | -0.913 |
| -1.489114917801682 | -5.561 | -1.184 | -0.908 |
| -1.482831732494503 | -5.562 | -1.164 | -0.903 |
| -1.476548547187323 | -5.564 | -1.144 | -0.897 |
| -1.470265361880144 | -5.566 | -1.124 | -0.892 |
| -1.463982176572964 | -5.568 | -1.105 | -0.886 |
| -1.457698991265784 | -5.57 | -1.085 | -0.879 |
| -1.451415805958605 | -5.573 | -1.067 | -0.873 |
| -1.445132620651425 | -5.575 | -1.048 | -0.866 |
| -1.438849435344245 | -5.577 | -1.03 | -0.859 |
| -1.432566250037066 | -5.58 | -1.012 | -0.851 |
| -1.426283064729886 | -5.582 | -0.994 | -0.844 |
| -1.419999879422706 | -5.585 | -0.977 | -0.836 |
| -1.413716694115527 | -5.588 | -0.96 | -0.828 |
| -1.407433508808347 | -5.591 | -0.943 | -0.82 |
| -1.401150323501168 | -5.594 | -0.927 | -0.812 |
| -1.394867138193988 | -5.597 | -0.911 | -0.803 |
| -1.388583952886808 | -5.6 | -0.895 | -0.794 |
| -1.382300767579629 | -5.603 | -0.879 | -0.786 |
| -1.376017582272449 | -5.606 | -0.864 | -0.777 |
| -1.369734396965269 | -5.609 | -0.849 | -0.768 |
| -1.36345121165809 | -5.612 | -0.834 | -0.758 |
| -1.35716802635091 | -5.616 | -0.82 | -0.749 |
| -1.35088484104373 | -5.619 | -0.806 | -0.74 |
| -1.344601655736551 | -5.622 | -0.792 | -0.73 |
| -1.338318470429371 | -5.626 | -0.778 | -0.72 |
| -1.332035285122191 | -5.629 | -0.765 | -0.711 |
| -1.325752099815012 | -5.633 | -0.752 | -0.701 |
| -1.319468914507832 | -5.636 | -0.739 | -0.691 |
| -1.313185729200653 | -5.64 | -0.727 | -0.681 |
| -1.306902543893473 | -5.644 | -0.714 | -0.671 |
| -1.300619358586293 | -5.647 | -0.702 | -0.661 |
| -1.294336173279114 | -5.651 | -0.691 | -0.651 |
| -1.288052987971934 | -5.655 | -0.679 | -0.641 |
| -1.281769802664754 | -5.658 | -0.668 | -0.631 |
| -1.275486617357575 | -5.662 | -0.657 | -0.621 |
| -1.269203432050395 | -5.666 | -0.646 | -0.611 |
| -1.262920246743215 | -5.67 | -0.636 | -0.601 |
| -1.256637061436036 | -5.674 | -0.626 | -0.591 |
| -1.250353876128856 | -5.678 | -0.616 | -0.581 |
| -1.244070690821677 | -5.681 | -0.606 | -0.57 |
| -1.237787505514497 | -5.685 | -0.596 | -0.56 |
| -1.231504320207317 | -5.689 | -0.587 | -0.55 |
| -1.225221134900138 | -5.693 | -0.578 | -0.54 |
| -1.218937949592958 | -5.697 | -0.569 | -0.531 |
| -1.212654764285778 | -5.701 | -0.561 | -0.521 |
| -1.206371578978599 | -5.705 | -0.552 | -0.511 |
| -1.20008839367142 | -5.709 | -0.544 | -0.501 |
| -1.193805208364239 | -5.713 | -0.536 | -0.491 |
| -1.18752202305706 | -5.717 | -0.529 | -0.482 |
| -1.18123883774988 | -5.721 | -0.521 | -0.472 |
| -1.1749556524427 | -5.725 | -0.514 | -0.463 |
| -1.168672467135521 | -5.728 | -0.507 | -0.453 |
| -1.162389281828341 | -5.732 | -0.5 | -0.444 |
| -1.156106096521162 | -5.736 | -0.493 | -0.435 |
| -1.149822911213982 | -5.74 | -0.487 | -0.426 |
| -1.143539725906802 | -5.744 | -0.481 | -0.416 |
| -1.137256540599623 | -5.748 | -0.475 | -0.407 |
| -1.130973355292443 | -5.752 | -0.469 | -0.399 |
| -1.124690169985263 | -5.756 | -0.463 | -0.39 |
| -1.118406984678084 | -5.76 | -0.457 | -0.381 |
| -1.112123799370904 | -5.763 | -0.452 | -0.373 |
| -1.105840614063724 | -5.767 | -0.447 | -0.364 |
| -1.099557428756545 | -5.771 | -0.442 | -0.356 |
| -1.093274243449365 | -5.775 | -0.437 | -0.348 |
| -1.086991058142186 | -5.779 | -0.433 | -0.34 |
| -1.080707872835006 | -5.782 | -0.428 | -0.332 |
| -1.074424687527826 | -5.786 | -0.424 | -0.324 |
| -1.068141502220647 | -5.79 | -0.419 | -0.316 |
| -1.061858316913467 | -5.793 | -0.415 | -0.309 |
| -1.055575131606287 | -5.797 | -0.412 | -0.301 |
| -1.049291946299108 | -5.801 | -0.408 | -0.294 |
| -1.043008760991928 | -5.804 | -0.404 | -0.287 |
| -1.036725575684748 | -5.808 | -0.401 | -0.28 |
| -1.030442390377569 | -5.811 | -0.398 | -0.273 |
| -1.024159205070389 | -5.815 | -0.394 | -0.266 |
| -1.01787601976321 | -5.818 | -0.391 | -0.259 |
| -1.01159283445603 | -5.822 | -0.388 | -0.253 |
| -1.00530964914885 | -5.825 | -0.386 | -0.246 |
| -0.999026463841671 | -5.829 | -0.383 | -0.24 |
| -0.992743278534491 | -5.832 | -0.38 | -0.234 |
| -0.986460093227311 | -5.836 | -0.378 | -0.228 |
| -0.980176907920132 | -5.839 | -0.376 | -0.222 |
| -0.973893722612952 | -5.842 | -0.374 | -0.216 |
| -0.967610537305772 | -5.845 | -0.371 | -0.211 |
| -0.961327351998593 | -5.849 | -0.369 | -0.205 |
| -0.955044166691413 | -5.852 | -0.368 | -0.2 |
| -0.948760981384233 | -5.855 | -0.366 | -0.195 |
| -0.942477796077054 | -5.858 | -0.364 | -0.19 |
| -0.936194610769874 | -5.861 | -0.363 | -0.185 |
| -0.929911425462695 | -5.864 | -0.361 | -0.18 |
| -0.923628240155515 | -5.867 | -0.36 | -0.175 |
| -0.917345054848335 | -5.87 | -0.358 | -0.171 |
| -0.911061869541156 | -5.873 | -0.357 | -0.166 |
| -0.904778684233976 | -5.876 | -0.356 | -0.162 |
| -0.898495498926796 | -5.879 | -0.355 | -0.158 |
| -0.892212313619617 | -5.882 | -0.354 | -0.154 |
| -0.885929128312437 | -5.884 | -0.353 | -0.15 |
| -0.879645943005257 | -5.887 | -0.352 | -0.146 |
| -0.873362757698078 | -5.89 | -0.351 | -0.142 |
| -0.867079572390898 | -5.892 | -0.351 | -0.139 |
| -0.860796387083718 | -5.895 | -0.35 | -0.135 |
| -0.854513201776539 | -5.898 | -0.35 | -0.132 |
| -0.848230016469359 | -5.9 | -0.349 | -0.129 |
| -0.84194683116218 | -5.903 | -0.349 | -0.126 |
| -0.835663645855 | -5.905 | -0.348 | -0.123 |
| -0.82938046054782 | -5.908 | -0.348 | -0.12 |
| -0.823097275240641 | -5.91 | -0.348 | -0.117 |
| -0.816814089933461 | -5.912 | -0.347 | -0.114 |
| -0.810530904626281 | -5.915 | -0.347 | -0.112 |
| -0.804247719319102 | -5.917 | -0.347 | -0.109 |
| -0.797964534011922 | -5.919 | -0.347 | -0.107 |
| -0.791681348704742 | -5.922 | -0.347 | -0.104 |
| -0.785398163397563 | -5.924 | -0.347 | -0.102 |
| -0.779114978090383 | -5.926 | -0.347 | -0.1 |
| -0.772831792783204 | -5.928 | -0.347 | -0.098 |
| -0.766548607476024 | -5.93 | -0.347 | -0.096 |
| -0.760265422168844 | -5.932 | -0.347 | -0.094 |
| -0.753982236861665 | -5.934 | -0.347 | -0.093 |
| -0.747699051554485 | -5.936 | -0.347 | -0.091 |
| -0.741415866247305 | -5.938 | -0.348 | -0.089 |
| -0.735132680940126 | -5.94 | -0.348 | -0.088 |
| -0.728849495632946 | -5.942 | -0.348 | -0.086 |
| -0.722566310325766 | -5.943 | -0.348 | -0.085 |
| -0.716283125018587 | -5.945 | -0.349 | -0.084 |
| -0.709999939711407 | -5.947 | -0.349 | -0.082 |
| -0.703716754404227 | -5.949 | -0.349 | -0.081 |
| -0.697433569097048 | -5.95 | -0.35 | -0.08 |
| -0.691150383789868 | -5.952 | -0.35 | -0.079 |
| -0.684867198482689 | -5.953 | -0.351 | -0.078 |
| -0.678584013175509 | -5.955 | -0.351 | -0.077 |
| -0.672300827868329 | -5.956 | -0.351 | -0.076 |
| -0.66601764256115 | -5.958 | -0.352 | -0.076 |
| -0.65973445725397 | -5.959 | -0.352 | -0.075 |
| -0.65345127194679 | -5.961 | -0.353 | -0.074 |
| -0.647168086639611 | -5.962 | -0.353 | -0.074 |
| -0.640884901332431 | -5.963 | -0.354 | -0.073 |
| -0.634601716025251 | -5.965 | -0.354 | -0.072 |
| -0.628318530718072 | -5.966 | -0.355 | -0.072 |
| -0.622035345410892 | -5.967 | -0.355 | -0.071 |
| -0.615752160103712 | -5.968 | -0.356 | -0.071 |
| -0.609468974796533 | -5.97 | -0.356 | -0.071 |
| -0.603185789489353 | -5.971 | -0.357 | -0.07 |
| -0.596902604182174 | -5.972 | -0.357 | -0.07 |
| -0.590619418874994 | -5.973 | -0.358 | -0.07 |
| -0.584336233567814 | -5.974 | -0.358 | -0.069 |
| -0.578053048260635 | -5.975 | -0.359 | -0.069 |
| -0.571769862953455 | -5.976 | -0.359 | -0.069 |
| -0.565486677646275 | -5.977 | -0.359 | -0.069 |
| -0.559203492339096 | -5.978 | -0.36 | -0.069 |
| -0.552920307031916 | -5.979 | -0.36 | -0.069 |
| -0.546637121724737 | -5.98 | -0.361 | -0.069 |
| -0.540353936417557 | -5.981 | -0.361 | -0.069 |
| -0.534070751110377 | -5.982 | -0.362 | -0.069 |
| -0.527787565803198 | -5.982 | -0.362 | -0.069 |
| -0.521504380496018 | -5.983 | -0.363 | -0.069 |
| -0.515221195188838 | -5.984 | -0.363 | -0.069 |
| -0.508938009881659 | -5.985 | -0.364 | -0.069 |
| -0.502654824574479 | -5.985 | -0.364 | -0.069 |
| -0.496371639267299 | -5.986 | -0.365 | -0.069 |
| -0.49008845396012 | -5.987 | -0.365 | -0.069 |
| -0.48380526865294 | -5.987 | -0.365 | -0.069 |
| -0.477522083345761 | -5.988 | -0.366 | -0.069 |
| -0.471238898038581 | -5.989 | -0.366 | -0.069 |
| -0.464955712731402 | -5.989 | -0.367 | -0.069 |
| -0.458672527424222 | -5.99 | -0.367 | -0.069 |
| -0.452389342117042 | -5.99 | -0.367 | -0.069 |
| -0.446106156809863 | -5.991 | -0.368 | -0.069 |
| -0.439822971502683 | -5.991 | -0.368 | -0.07 |
| -0.433539786195504 | -5.992 | -0.368 | -0.07 |
| -0.427256600888324 | -5.992 | -0.369 | -0.07 |
| -0.420973415581144 | -5.993 | -0.369 | -0.07 |
| -0.414690230273965 | -5.993 | -0.369 | -0.07 |
| -0.408407044966785 | -5.993 | -0.37 | -0.07 |
| -0.402123859659606 | -5.994 | -0.37 | -0.07 |
| -0.395840674352426 | -5.994 | -0.37 | -0.071 |
| -0.389557489045247 | -5.995 | -0.37 | -0.071 |
| -0.383274303738067 | -5.995 | -0.371 | -0.071 |
| -0.376991118430887 | -5.995 | -0.371 | -0.071 |
| -0.370707933123708 | -5.995 | -0.371 | -0.071 |
| -0.364424747816528 | -5.996 | -0.371 | -0.071 |
| -0.358141562509349 | -5.996 | -0.372 | -0.071 |
| -0.351858377202169 | -5.996 | -0.372 | -0.072 |
| -0.345575191894989 | -5.997 | -0.372 | -0.072 |
| -0.33929200658781 | -5.997 | -0.372 | -0.072 |
| -0.33300882128063 | -5.997 | -0.372 | -0.072 |
| -0.326725635973451 | -5.997 | -0.373 | -0.072 |
| -0.320442450666271 | -5.997 | -0.373 | -0.072 |
| -0.314159265359092 | -5.998 | -0.373 | -0.072 |
| -0.307876080051912 | -5.998 | -0.373 | -0.072 |
| -0.301592894744732 | -5.998 | -0.373 | -0.073 |
| -0.295309709437553 | -5.998 | -0.373 | -0.073 |
| -0.289026524130373 | -5.998 | -0.373 | -0.073 |
| -0.282743338823194 | -5.998 | -0.374 | -0.073 |
| -0.276460153516014 | -5.999 | -0.374 | -0.073 |
| -0.270176968208834 | -5.999 | -0.374 | -0.073 |
| -0.263893782901655 | -5.999 | -0.374 | -0.073 |
| -0.257610597594475 | -5.999 | -0.374 | -0.073 |
| -0.251327412287296 | -5.999 | -0.374 | -0.073 |
| -0.245044226980116 | -5.999 | -0.374 | -0.073 |
| -0.238761041672937 | -5.999 | -0.374 | -0.073 |
| -0.232477856365757 | -5.999 | -0.374 | -0.073 |
| -0.226194671058577 | -5.999 | -0.374 | -0.074 |
| -0.219911485751398 | -5.999 | -0.374 | -0.074 |
| -0.213628300444218 | -5.999 | -0.375 | -0.074 |
| -0.207345115137039 | -6 | -0.375 | -0.074 |
| -0.201061929829859 | -6 | -0.375 | -0.074 |
| -0.194778744522679 | -6 | -0.375 | -0.074 |
| -0.1884955592155 | -6 | -0.375 | -0.074 |
| -0.18221237390832 | -6 | -0.375 | -0.074 |
| -0.175929188601141 | -6 | -0.375 | -0.074 |
| -0.169646003293961 | -6 | -0.375 | -0.074 |
| -0.163362817986782 | -6 | -0.375 | -0.074 |
| -0.157079632679602 | -6 | -0.375 | -0.074 |
| -0.150796447372422 | -6 | -0.375 | -0.074 |
| -0.144513262065243 | -6 | -0.375 | -0.074 |
| -0.138230076758063 | -6 | -0.375 | -0.074 |
| -0.131946891450884 | -6 | -0.375 | -0.074 |
| -0.125663706143704 | -6 | -0.375 | -0.074 |
| -0.119380520836524 | -6 | -0.375 | -0.074 |
| -0.113097335529345 | -6 | -0.375 | -0.074 |
| -0.106814150222165 | -6 | -0.375 | -0.074 |
| -0.100530964914986 | -6 | -0.375 | -0.074 |
| -0.0942477796078061 | -6 | -0.375 | -0.074 |
| -0.0879645943006265 | -6 | -0.375 | -0.074 |
| -0.0816814089934469 | -6 | -0.375 | -0.074 |
| -0.0753982236862674 | -6 | -0.375 | -0.074 |
| -0.0691150383790878 | -6 | -0.375 | -0.074 |
| -0.0628318530719082 | -6 | -0.375 | -0.074 |
| -0.0565486677647286 | -6 | -0.375 | -0.074 |
| -0.050265482457549 | -6 | -0.375 | -0.074 |
| -0.0439822971503694 | -6 | -0.375 | -0.074 |
| -0.0376991118431899 | -6 | -0.375 | -0.074 |
| -0.0314159265360103 | -6 | -0.375 | -0.074 |
| -0.0251327412288307 | -6 | -0.375 | -0.074 |
| -0.0188495559216511 | -6 | -0.375 | -0.074 |
| -0.0125663706144715 | -6 | -0.375 | -0.074 |
| -0.00628318530729192 | -6 | -0.375 | -0.074 |
| -1.12338957580782e-13 | -6 | -0.375 | -0.074 |
| 0.00628318530706725 | -6 | -0.375 | -0.074 |
| 0.0125663706142468 | -6 | -0.375 | -0.074 |
| 0.0188495559214264 | -6 | -0.375 | -0.074 |
| 0.025132741228606 | -6 | -0.375 | -0.074 |
| 0.0314159265357856 | -6 | -0.375 | -0.074 |
| 0.0376991118429652 | -6 | -0.375 | -0.074 |
| 0.0439822971501448 | -6 | -0.375 | -0.074 |
| 0.0502654824573243 | -6 | -0.375 | -0.074 |
| 0.0565486677645039 | -6 | -0.375 | -0.074 |
| 0.0628318530716835 | -6 | -0.375 | -0.074 |
| 0.0691150383788631 | -6 | -0.375 | -0.074 |
| 0.0753982236860427 | -6 | -0.375 | -0.074 |
| 0.0816814089932222 | -6 | -0.375 | -0.074 |
| 0.0879645943004018 | -6 | -0.375 | -0.074 |
| 0.0942477796075814 | -6 | -0.375 | -0.074 |
| 0.100530964914761 | -6 | -0.375 | -0.074 |
| 0.106814150221941 | -6 | -0.375 | -0.074 |
| 0.11309733552912 | -6 | -0.375 | -0.074 |
| 0.1193805208363 | -6 | -0.375 | -0.074 |
| 0.125663706143479 | -6 | -0.375 | -0.074 |
| 0.131946891450659 | -6 | -0.375 | -0.074 |
| 0.138230076757839 | -6 | -0.375 | -0.074 |
| 0.144513262065018 | -6 | -0.375 | -0.074 |
| 0.150796447372198 | -6 | -0.375 | -0.074 |
| 0.157079632679377 | -6 | -0.375 | -0.074 |
| 0.163362817986557 | -6 | -0.375 | -0.074 |
| 0.169646003293736 | -6 | -0.375 | -0.074 |
| 0.175929188600916 | -6 | -0.375 | -0.074 |
| 0.182212373908096 | -6 | -0.375 | -0.074 |
| 0.188495559215275 | -6 | -0.375 | -0.074 |
| 0.194778744522455 | -6 | -0.375 | -0.074 |
| 0.201061929829634 | -6 | -0.375 | -0.074 |
| 0.207345115136814 | -6 | -0.375 | -0.074 |
| 0.213628300443994 | -5.999 | -0.375 | -0.074 |
| 0.219911485751173 | -5.999 | -0.374 | -0.074 |
| 0.226194671058353 | -5.999 | -0.374 | -0.074 |
| 0.232477856365532 | -5.999 | -0.374 | -0.073 |
| 0.238761041672712 | -5.999 | -0.374 | -0.073 |
| 0.245044226979891 | -5.999 | -0.374 | -0.073 |
| 0.251327412287071 | -5.999 | -0.374 | -0.073 |
| 0.257610597594251 | -5.999 | -0.374 | -0.073 |
| 0.26389378290143 | -5.999 | -0.374 | -0.073 |
| 0.27017696820861 | -5.999 | -0.374 | -0.073 |
| 0.276460153515789 | -5.999 | -0.374 | -0.073 |
| 0.282743338822969 | -5.998 | -0.374 | -0.073 |
| 0.289026524130149 | -5.998 | -0.373 | -0.073 |
| 0.295309709437328 | -5.998 | -0.373 | -0.073 |
| 0.301592894744508 | -5.998 | -0.373 | -0.073 |
| 0.307876080051687 | -5.998 | -0.373 | -0.072 |
| 0.314159265358867 | -5.998 | -0.373 | -0.072 |
| 0.320442450666046 | -5.997 | -0.373 | -0.072 |
| 0.326725635973226 | -5.997 | -0.373 | -0.072 |
| 0.333008821280406 | -5.997 | -0.372 | -0.072 |
| 0.339292006587585 | -5.997 | -0.372 | -0.072 |
| 0.345575191894765 | -5.997 | -0.372 | -0.072 |
| 0.351858377201944 | -5.996 | -0.372 | -0.072 |
| 0.358141562509124 | -5.996 | -0.372 | -0.071 |
| 0.364424747816304 | -5.996 | -0.371 | -0.071 |
| 0.370707933123483 | -5.995 | -0.371 | -0.071 |
| 0.376991118430663 | -5.995 | -0.371 | -0.071 |
| 0.383274303737842 | -5.995 | -0.371 | -0.071 |
| 0.389557489045022 | -5.995 | -0.37 | -0.071 |
| 0.395840674352201 | -5.994 | -0.37 | -0.071 |
| 0.402123859659381 | -5.994 | -0.37 | -0.07 |
| 0.408407044966561 | -5.993 | -0.37 | -0.07 |
| 0.41469023027374 | -5.993 | -0.369 | -0.07 |
| 0.42097341558092 | -5.993 | -0.369 | -0.07 |
| 0.427256600888099 | -5.992 | -0.369 | -0.07 |
| 0.433539786195279 | -5.992 | -0.368 | -0.07 |
| 0.439822971502459 | -5.991 | -0.368 | -0.07 |
| 0.446106156809638 | -5.991 | -0.368 | -0.069 |
| 0.452389342116818 | -5.99 | -0.367 | -0.069 |
| 0.458672527423997 | -5.99 | -0.367 | -0.069 |
| 0.464955712731177 | -5.989 | -0.367 | -0.069 |
| 0.471238898038356 | -5.989 | -0.366 | -0.069 |
| 0.477522083345536 | -5.988 | -0.366 | -0.069 |
| 0.483805268652716 | -5.987 | -0.365 | -0.069 |
| 0.490088453959895 | -5.987 | -0.365 | -0.069 |
| 0.496371639267075 | -5.986 | -0.365 | -0.069 |
| 0.502654824574254 | -5.985 | -0.364 | -0.069 |
| 0.508938009881434 | -5.985 | -0.364 | -0.069 |
| 0.515221195188614 | -5.984 | -0.363 | -0.069 |
| 0.521504380495793 | -5.983 | -0.363 | -0.069 |
| 0.527787565802973 | -5.982 | -0.362 | -0.069 |
| 0.534070751110153 | -5.982 | -0.362 | -0.069 |
| 0.540353936417332 | -5.981 | -0.361 | -0.069 |
| 0.546637121724512 | -5.98 | -0.361 | -0.069 |
| 0.552920307031692 | -5.979 | -0.36 | -0.069 |
| 0.559203492338871 | -5.978 | -0.36 | -0.069 |
| 0.565486677646051 | -5.977 | -0.359 | -0.069 |
| 0.571769862953231 | -5.976 | -0.359 | -0.069 |
| 0.57805304826041 | -5.975 | -0.359 | -0.069 |
| 0.58433623356759 | -5.974 | -0.358 | -0.069 |
| 0.590619418874769 | -5.973 | -0.358 | -0.07 |
| 0.596902604181949 | -5.972 | -0.357 | -0.07 |
| 0.603185789489129 | -5.971 | -0.357 | -0.07 |
| 0.609468974796308 | -5.97 | -0.356 | -0.071 |
| 0.615752160103488 | -5.968 | -0.356 | -0.071 |
| 0.622035345410668 | -5.967 | -0.355 | -0.071 |
| 0.628318530717847 | -5.966 | -0.355 | -0.072 |
| 0.634601716025027 | -5.965 | -0.354 | -0.072 |
| 0.640884901332206 | -5.963 | -0.354 | -0.073 |
| 0.647168086639386 | -5.962 | -0.353 | -0.074 |
| 0.653451271946566 | -5.961 | -0.353 | -0.074 |
| 0.659734457253745 | -5.959 | -0.352 | -0.075 |
| 0.666017642560925 | -5.958 | -0.352 | -0.076 |
| 0.672300827868105 | -5.956 | -0.351 | -0.076 |
| 0.678584013175284 | -5.955 | -0.351 | -0.077 |
| 0.684867198482464 | -5.953 | -0.351 | -0.078 |
| 0.691150383789644 | -5.952 | -0.35 | -0.079 |
| 0.697433569096823 | -5.95 | -0.35 | -0.08 |
| 0.703716754404003 | -5.949 | -0.349 | -0.081 |
| 0.709999939711183 | -5.947 | -0.349 | -0.082 |
| 0.716283125018362 | -5.945 | -0.349 | -0.084 |
| 0.722566310325542 | -5.943 | -0.348 | -0.085 |
| 0.728849495632721 | -5.942 | -0.348 | -0.086 |
| 0.735132680939901 | -5.94 | -0.348 | -0.088 |
| 0.741415866247081 | -5.938 | -0.348 | -0.089 |
| 0.74769905155426 | -5.936 | -0.347 | -0.091 |
| 0.75398223686144 | -5.934 | -0.347 | -0.093 |
| 0.76026542216862 | -5.932 | -0.347 | -0.094 |
| 0.766548607475799 | -5.93 | -0.347 | -0.096 |
| 0.772831792782979 | -5.928 | -0.347 | -0.098 |
| 0.779114978090159 | -5.926 | -0.347 | -0.1 |
| 0.785398163397338 | -5.924 | -0.347 | -0.102 |
| 0.791681348704518 | -5.922 | -0.347 | -0.104 |
| 0.797964534011697 | -5.919 | -0.347 | -0.107 |
| 0.804247719318877 | -5.917 | -0.347 | -0.109 |
| 0.810530904626057 | -5.915 | -0.347 | -0.112 |
| 0.816814089933236 | -5.912 | -0.347 | -0.114 |
| 0.823097275240416 | -5.91 | -0.348 | -0.117 |
| 0.829380460547596 | -5.908 | -0.348 | -0.12 |
| 0.835663645854775 | -5.905 | -0.348 | -0.123 |
| 0.841946831161955 | -5.903 | -0.349 | -0.126 |
| 0.848230016469135 | -5.9 | -0.349 | -0.129 |
| 0.854513201776314 | -5.898 | -0.35 | -0.132 |
| 0.860796387083494 | -5.895 | -0.35 | -0.135 |
| 0.867079572390674 | -5.892 | -0.351 | -0.139 |
| 0.873362757697853 | -5.89 | -0.351 | -0.142 |
| 0.879645943005033 | -5.887 | -0.352 | -0.146 |
| 0.885929128312212 | -5.884 | -0.353 | -0.15 |
| 0.892212313619392 | -5.882 | -0.354 | -0.154 |
| 0.898495498926572 | -5.879 | -0.355 | -0.158 |
| 0.904778684233751 | -5.876 | -0.356 | -0.162 |
| 0.911061869540931 | -5.873 | -0.357 | -0.166 |
| 0.917345054848111 | -5.87 | -0.358 | -0.171 |
| 0.92362824015529 | -5.867 | -0.36 | -0.175 |
| 0.92991142546247 | -5.864 | -0.361 | -0.18 |
| 0.93619461076965 | -5.861 | -0.363 | -0.185 |
| 0.942477796076829 | -5.858 | -0.364 | -0.19 |
| 0.948760981384009 | -5.855 | -0.366 | -0.195 |
| 0.955044166691188 | -5.852 | -0.368 | -0.2 |
| 0.961327351998368 | -5.849 | -0.369 | -0.205 |
| 0.967610537305548 | -5.845 | -0.371 | -0.211 |
| 0.973893722612727 | -5.842 | -0.374 | -0.216 |
| 0.980176907919907 | -5.839 | -0.376 | -0.222 |
| 0.986460093227087 | -5.836 | -0.378 | -0.228 |
| 0.992743278534266 | -5.832 | -0.38 | -0.234 |
| 0.999026463841446 | -5.829 | -0.383 | -0.24 |
| 1.005309649148626 | -5.825 | -0.386 | -0.246 |
| 1.011592834455805 | -5.822 | -0.388 | -0.253 |
| 1.017876019762985 | -5.818 | -0.391 | -0.259 |
| 1.024159205070164 | -5.815 | -0.394 | -0.266 |
| 1.030442390377344 | -5.811 | -0.398 | -0.273 |
| 1.036725575684524 | -5.808 | -0.401 | -0.28 |
| 1.043008760991703 | -5.804 | -0.404 | -0.287 |
| 1.049291946298883 | -5.801 | -0.408 | -0.294 |
| 1.055575131606063 | -5.797 | -0.412 | -0.301 |
| 1.061858316913242 | -5.793 | -0.415 | -0.309 |
| 1.068141502220422 | -5.79 | -0.419 | -0.316 |
| 1.074424687527602 | -5.786 | -0.424 | -0.324 |
| 1.080707872834781 | -5.782 | -0.428 | -0.332 |
| 1.086991058141961 | -5.779 | -0.433 | -0.34 |
| 1.09327424344914 | -5.775 | -0.437 | -0.348 |
| 1.09955742875632 | -5.771 | -0.442 | -0.356 |
| 1.1058406140635 | -5.767 | -0.447 | -0.364 |
| 1.112123799370679 | -5.763 | -0.452 | -0.373 |
| 1.11840698467786 | -5.76 | -0.457 | -0.381 |
| 1.124690169985039 | -5.756 | -0.463 | -0.39 |
| 1.130973355292218 | -5.752 | -0.469 | -0.399 |
| 1.137256540599398 | -5.748 | -0.475 | -0.407 |
| 1.143539725906578 | -5.744 | -0.481 | -0.416 |
| 1.149822911213757 | -5.74 | -0.487 | -0.426 |
| 1.156106096520937 | -5.736 | -0.493 | -0.435 |
| 1.162389281828116 | -5.732 | -0.5 | -0.444 |
| 1.168672467135296 | -5.728 | -0.507 | -0.453 |
| 1.174955652442476 | -5.725 | -0.514 | -0.463 |
| 1.181238837749655 | -5.721 | -0.521 | -0.472 |
| 1.187522023056835 | -5.717 | -0.529 | -0.482 |
| 1.193805208364015 | -5.713 | -0.536 | -0.491 |
| 1.200088393671194 | -5.709 | -0.544 | -0.501 |
| 1.206371578978374 | -5.705 | -0.552 | -0.511 |
| 1.212654764285554 | -5.701 | -0.561 | -0.521 |
| 1.218937949592733 | -5.697 | -0.569 | -0.531 |
| 1.225221134899913 | -5.693 | -0.578 | -0.54 |
| 1.231504320207093 | -5.689 | -0.587 | -0.55 |
| 1.237787505514272 | -5.685 | -0.596 | -0.56 |
| 1.244070690821452 | -5.681 | -0.606 | -0.57 |
| 1.250353876128631 | -5.678 | -0.616 | -0.581 |
| 1.256637061435811 | -5.674 | -0.626 | -0.591 |
| 1.262920246742991 | -5.67 | -0.636 | -0.601 |
| 1.26920343205017 | -5.666 | -0.646 | -0.611 |
| 1.27548661735735 | -5.662 | -0.657 | -0.621 |
| 1.28176980266453 | -5.658 | -0.668 | -0.631 |
| 1.28805298797171 | -5.655 | -0.679 | -0.641 |
| 1.294336173278889 | -5.651 | -0.691 | -0.651 |
| 1.300619358586069 | -5.647 | -0.702 | -0.661 |
| 1.306902543893248 | -5.644 | -0.714 | -0.671 |
| 1.313185729200428 | -5.64 | -0.727 | -0.681 |
| 1.319468914507607 | -5.636 | -0.739 | -0.691 |
| 1.325752099814787 | -5.633 | -0.752 | -0.701 |
| 1.332035285121967 | -5.629 | -0.765 | -0.711 |
| 1.338318470429146 | -5.626 | -0.778 | -0.72 |
| 1.344601655736326 | -5.622 | -0.792 | -0.73 |
| 1.350884841043506 | -5.619 | -0.806 | -0.74 |
| 1.357168026350685 | -5.616 | -0.82 | -0.749 |
| 1.363451211657865 | -5.612 | -0.834 | -0.758 |
| 1.369734396965045 | -5.609 | -0.849 | -0.768 |
| 1.376017582272224 | -5.606 | -0.864 | -0.777 |
| 1.382300767579404 | -5.603 | -0.879 | -0.786 |
| 1.388583952886583 | -5.6 | -0.895 | -0.794 |
| 1.394867138193763 | -5.597 | -0.911 | -0.803 |
| 1.401150323500943 | -5.594 | -0.927 | -0.812 |
| 1.407433508808122 | -5.591 | -0.943 | -0.82 |
| 1.413716694115302 | -5.588 | -0.96 | -0.828 |
| 1.419999879422482 | -5.585 | -0.977 | -0.836 |
| 1.426283064729661 | -5.582 | -0.994 | -0.844 |
| 1.432566250036841 | -5.58 | -1.012 | -0.851 |
| 1.438849435344021 | -5.577 | -1.03 | -0.859 |
| 1.4451326206512 | -5.575 | -1.048 | -0.866 |
| 1.45141580595838 | -5.573 | -1.067 | -0.873 |
| 1.45769899126556 | -5.57 | -1.085 | -0.879 |
| 1.46398217657274 | -5.568 | -1.105 | -0.886 |
| 1.470265361879919 | -5.566 | -1.124 | -0.892 |
| 1.476548547187098 | -5.564 | -1.144 | -0.897 |
| 1.482831732494278 | -5.562 | -1.164 | -0.903 |
| 1.489114917801458 | -5.561 | -1.184 | -0.908 |
| 1.495398103108637 | -5.559 | -1.205 | -0.913 |
| 1.501681288415817 | -5.557 | -1.226 | -0.918 |
| 1.507964473722997 | -5.556 | -1.247 | -0.922 |
| 1.514247659030176 | -5.555 | -1.268 | -0.926 |
| 1.520530844337356 | -5.554 | -1.29 | -0.929 |
| 1.526814029644536 | -5.553 | -1.312 | -0.932 |
| 1.533097214951715 | -5.552 | -1.335 | -0.935 |
| 1.539380400258895 | -5.551 | -1.357 | -0.937 |
| 1.545663585566075 | -5.55 | -1.38 | -0.939 |
| 1.551946770873254 | -5.55 | -1.404 | -0.941 |
| 1.558229956180434 | -5.549 | -1.427 | -0.942 |
| 1.564513141487613 | -5.549 | -1.451 | -0.943 |
| 1.570796326794793 | -5.549 | -1.476 | -0.943 |
| 1.577079512101973 | -5.549 | -1.5 | -0.943 |
| 1.583362697409152 | -5.549 | -1.525 | -0.942 |
| 1.589645882716332 | -5.55 | -1.55 | -0.941 |
| 1.595929068023512 | -5.55 | -1.575 | -0.939 |
| 1.602212253330691 | -5.551 | -1.601 | -0.937 |
| 1.608495438637871 | -5.552 | -1.627 | -0.934 |
| 1.61477862394505 | -5.553 | -1.653 | -0.931 |
| 1.62106180925223 | -5.554 | -1.68 | -0.927 |
| 1.62734499455941 | -5.556 | -1.706 | -0.923 |
| 1.633628179866589 | -5.557 | -1.733 | -0.918 |
| 1.63991136517377 | -5.559 | -1.761 | -0.913 |
| 1.646194550480949 | -5.561 | -1.788 | -0.907 |
| 1.652477735788128 | -5.563 | -1.816 | -0.9 |
| 1.658760921095308 | -5.566 | -1.844 | -0.893 |
| 1.665044106402488 | -5.568 | -1.873 | -0.885 |
| 1.671327291709667 | -5.571 | -1.901 | -0.877 |
| 1.677610477016847 | -5.574 | -1.93 | -0.868 |
| 1.683893662324026 | -5.578 | -1.959 | -0.858 |
| 1.690176847631206 | -5.581 | -1.989 | -0.848 |
| 1.696460032938386 | -5.585 | -2.018 | -0.837 |
| 1.702743218245565 | -5.589 | -2.048 | -0.825 |
| 1.709026403552745 | -5.593 | -2.078 | -0.813 |
| 1.715309588859925 | -5.597 | -2.108 | -0.8 |
| 1.721592774167104 | -5.602 | -2.139 | -0.786 |
| 1.727875959474284 | -5.607 | -2.17 | -0.772 |
| 1.734159144781464 | -5.612 | -2.2 | -0.757 |
| 1.740442330088643 | -5.618 | -2.232 | -0.741 |
| 1.746725515395823 | -5.623 | -2.263 | -0.724 |
| 1.753008700703003 | -5.629 | -2.294 | -0.707 |
| 1.759291886010182 | -5.636 | -2.326 | -0.689 |
| 1.765575071317362 | -5.642 | -2.358 | -0.671 |
| 1.771858256624541 | -5.649 | -2.39 | -0.651 |
| 1.778141441931721 | -5.656 | -2.422 | -0.631 |
| 1.784424627238901 | -5.664 | -2.455 | -0.61 |
| 1.79070781254608 | -5.671 | -2.487 | -0.588 |
| 1.79699099785326 | -5.679 | -2.52 | -0.566 |
| 1.80327418316044 | -5.688 | -2.553 | -0.542 |
| 1.809557368467619 | -5.696 | -2.586 | -0.518 |
| 1.815840553774799 | -5.705 | -2.619 | -0.494 |
| 1.822123739081979 | -5.715 | -2.652 | -0.468 |
| 1.828406924389158 | -5.724 | -2.686 | -0.442 |
| 1.834690109696338 | -5.734 | -2.719 | -0.414 |
| 1.840973295003518 | -5.744 | -2.753 | -0.386 |
| 1.847256480310697 | -5.755 | -2.786 | -0.358 |
| 1.853539665617877 | -5.766 | -2.82 | -0.328 |
| 1.859822850925056 | -5.777 | -2.854 | -0.297 |
| 1.866106036232236 | -5.789 | -2.888 | -0.266 |
| 1.872389221539416 | -5.801 | -2.922 | -0.234 |
| 1.878672406846595 | -5.814 | -2.956 | -0.201 |
| 1.884955592153775 | -5.826 | -2.99 | -0.168 |
| 1.891238777460955 | -5.84 | -3.024 | -0.133 |
| 1.897521962768134 | -5.853 | -3.058 | -0.098 |
| 1.903805148075314 | -5.867 | -3.092 | -0.062 |
| 1.910088333382494 | -5.882 | -3.126 | -0.025 |
| 1.916371518689673 | -5.896 | -3.16 | 0.013 |
| 1.922654703996853 | -5.911 | -3.194 | 0.051 |
| 1.928937889304033 | -5.927 | -3.228 | 0.09 |
| 1.935221074611212 | -5.943 | -3.262 | 0.13 |
| 1.941504259918392 | -5.96 | -3.296 | 0.171 |
| 1.947787445225571 | -5.976 | -3.33 | 0.213 |
| 1.954070630532751 | -5.994 | -3.364 | 0.255 |
| 1.960353815839931 | -6.011 | -3.398 | 0.298 |
| 1.96663700114711 | -6.03 | -3.431 | 0.342 |
| 1.97292018645429 | -6.048 | -3.465 | 0.387 |
| 1.97920337176147 | -6.067 | -3.498 | 0.432 |
| 1.985486557068649 | -6.087 | -3.532 | 0.479 |
| 1.991769742375829 | -6.107 | -3.565 | 0.526 |
| 1.998052927683009 | -6.128 | -3.598 | 0.573 |
| 2.004336112990188 | -6.149 | -3.63 | 0.622 |
| 2.010619298297368 | -6.17 | -3.663 | 0.671 |
| 2.016902483604547 | -6.192 | -3.696 | 0.721 |
| 2.023185668911727 | -6.215 | -3.728 | 0.771 |
| 2.029468854218907 | -6.238 | -3.76 | 0.822 |
| 2.035752039526086 | -6.261 | -3.792 | 0.874 |
| 2.042035224833266 | -6.285 | -3.823 | 0.927 |
| 2.048318410140446 | -6.31 | -3.855 | 0.98 |
| 2.054601595447625 | -6.335 | -3.886 | 1.034 |
| 2.060884780754805 | -6.36 | -3.916 | 1.088 |
| 2.067167966061984 | -6.387 | -3.947 | 1.143 |
| 2.073451151369164 | -6.413 | -3.977 | 1.199 |
| 2.079734336676344 | -6.441 | -4.007 | 1.255 |
| 2.086017521983524 | -6.468 | -4.036 | 1.312 |
| 2.092300707290703 | -6.497 | -4.066 | 1.369 |
| 2.098583892597883 | -6.526 | -4.094 | 1.427 |
| 2.104867077905062 | -6.555 | -4.123 | 1.485 |
| 2.111150263212242 | -6.585 | -4.151 | 1.544 |
| 2.117433448519422 | -6.616 | -4.178 | 1.603 |
| 2.123716633826601 | -6.647 | -4.206 | 1.663 |
| 2.129999819133781 | -6.679 | -4.232 | 1.723 |
| 2.136283004440961 | -6.712 | -4.259 | 1.784 |
| 2.14256618974814 | -6.745 | -4.285 | 1.845 |
| 2.14884937505532 | -6.779 | -4.31 | 1.906 |
| 2.1551325603625 | -6.813 | -4.335 | 1.968 |
| 2.16141574566968 | -6.848 | -4.359 | 2.03 |
| 2.167698930976859 | -6.884 | -4.383 | 2.092 |
| 2.173982116284038 | -6.92 | -4.406 | 2.154 |
| 2.180265301591218 | -6.957 | -4.429 | 2.217 |
| 2.186548486898398 | -6.995 | -4.451 | 2.28 |
| 2.192831672205577 | -7.033 | -4.473 | 2.344 |
| 2.199114857512757 | -7.072 | -4.494 | 2.407 |
| 2.205398042819936 | -7.111 | -4.514 | 2.471 |
| 2.211681228127116 | -7.152 | -4.534 | 2.535 |
| 2.217964413434296 | -7.193 | -4.553 | 2.598 |
| 2.224247598741475 | -7.234 | -4.571 | 2.662 |
| 2.230530784048655 | -7.277 | -4.589 | 2.726 |
| 2.236813969355835 | -7.32 | -4.606 | 2.79 |
| 2.243097154663014 | -7.364 | -4.622 | 2.854 |
| 2.249380339970194 | -7.408 | -4.638 | 2.918 |
| 2.255663525277374 | -7.453 | -4.652 | 2.982 |
| 2.261946710584553 | -7.499 | -4.666 | 3.046 |
| 2.268229895891733 | -7.546 | -4.68 | 3.11 |
| 2.274513081198912 | -7.594 | -4.692 | 3.173 |
| 2.280796266506092 | -7.642 | -4.704 | 3.236 |
| 2.287079451813272 | -7.691 | -4.714 | 3.299 |
| 2.293362637120452 | -7.741 | -4.724 | 3.362 |
| 2.299645822427631 | -7.791 | -4.733 | 3.425 |
| 2.305929007734811 | -7.842 | -4.742 | 3.487 |
| 2.312212193041991 | -7.894 | -4.749 | 3.549 |
| 2.31849537834917 | -7.947 | -4.755 | 3.61 |
| 2.32477856365635 | -8.001 | -4.761 | 3.671 |
| 2.331061748963529 | -8.055 | -4.765 | 3.732 |
| 2.337344934270709 | -8.111 | -4.769 | 3.792 |
| 2.343628119577889 | -8.167 | -4.771 | 3.852 |
| 2.349911304885068 | -8.223 | -4.773 | 3.911 |
| 2.356194490192248 | -8.281 | -4.773 | 3.969 |
| 2.362477675499428 | -8.34 | -4.773 | 4.027 |
| 2.368760860806607 | -8.399 | -4.771 | 4.084 |
| 2.375044046113787 | -8.459 | -4.769 | 4.14 |
| 2.381327231420966 | -8.52 | -4.765 | 4.196 |
| 2.387610416728146 | -8.582 | -4.76 | 4.251 |
| 2.393893602035326 | -8.645 | -4.754 | 4.305 |
| 2.400176787342505 | -8.709 | -4.747 | 4.358 |
| 2.406459972649685 | -8.773 | -4.739 | 4.411 |
| 2.412743157956865 | -8.839 | -4.729 | 4.462 |
| 2.419026343264044 | -8.905 | -4.719 | 4.513 |
| 2.425309528571224 | -8.972 | -4.707 | 4.562 |
| 2.431592713878404 | -9.04 | -4.694 | 4.611 |
| 2.437875899185583 | -9.109 | -4.68 | 4.658 |
| 2.444159084492763 | -9.179 | -4.665 | 4.704 |
| 2.450442269799943 | -9.25 | -4.648 | 4.749 |
| 2.456725455107122 | -9.321 | -4.63 | 4.793 |
| 2.463008640414302 | -9.394 | -4.611 | 4.836 |
| 2.469291825721482 | -9.468 | -4.59 | 4.878 |
| 2.475575011028661 | -9.542 | -4.568 | 4.918 |
| 2.481858196335841 | -9.617 | -4.545 | 4.957 |
| 2.48814138164302 | -9.694 | -4.52 | 4.994 |
| 2.4944245669502 | -9.771 | -4.494 | 5.03 |
| 2.50070775225738 | -9.849 | -4.467 | 5.065 |
| 2.506990937564559 | -9.929 | -4.438 | 5.098 |
| 2.51327412287174 | -10.009 | -4.408 | 5.129 |
| 2.519557308178919 | -10.09 | -4.377 | 5.159 |
| 2.525840493486098 | -10.172 | -4.344 | 5.188 |
| 2.532123678793278 | -10.255 | -4.309 | 5.215 |
| 2.538406864100458 | -10.339 | -4.274 | 5.24 |
| 2.544690049407637 | -10.425 | -4.236 | 5.263 |
| 2.550973234714817 | -10.511 | -4.197 | 5.285 |
| 2.557256420021996 | -10.598 | -4.157 | 5.305 |
| 2.563539605329176 | -10.686 | -4.115 | 5.323 |
| 2.569822790636356 | -10.775 | -4.072 | 5.339 |
| 2.576105975943535 | -10.865 | -4.027 | 5.354 |
| 2.582389161250715 | -10.957 | -3.98 | 5.366 |
| 2.588672346557895 | -11.049 | -3.932 | 5.377 |
| 2.594955531865074 | -11.142 | -3.882 | 5.385 |
| 2.601238717172254 | -11.236 | -3.831 | 5.392 |
| 2.607521902479433 | -11.332 | -3.778 | 5.396 |
| 2.613805087786613 | -11.428 | -3.724 | 5.399 |
| 2.620088273093793 | -11.526 | -3.668 | 5.399 |
| 2.626371458400972 | -11.624 | -3.61 | 5.397 |
| 2.632654643708152 | -11.724 | -3.551 | 5.394 |
| 2.638937829015332 | -11.824 | -3.49 | 5.387 |
| 2.645221014322511 | -11.926 | -3.427 | 5.379 |
| 2.651504199629691 | -12.029 | -3.362 | 5.368 |
| 2.657787384936871 | -12.133 | -3.296 | 5.355 |
| 2.66407057024405 | -12.238 | -3.229 | 5.34 |
| 2.67035375555123 | -12.344 | -3.159 | 5.323 |
| 2.67663694085841 | -12.451 | -3.088 | 5.303 |
| 2.682920126165589 | -12.559 | -3.015 | 5.281 |
| 2.689203311472769 | -12.669 | -2.94 | 5.256 |
| 2.695486496779948 | -12.779 | -2.864 | 5.229 |
| 2.701769682087128 | -12.891 | -2.786 | 5.199 |
| 2.708052867394308 | -13.003 | -2.706 | 5.167 |
| 2.714336052701487 | -13.117 | -2.624 | 5.133 |
| 2.720619238008667 | -13.232 | -2.541 | 5.095 |
| 2.726902423315847 | -13.348 | -2.456 | 5.056 |
| 2.733185608623026 | -13.465 | -2.369 | 5.014 |
| 2.739468793930206 | -13.584 | -2.28 | 4.969 |
| 2.745751979237386 | -13.703 | -2.19 | 4.922 |
| 2.752035164544565 | -13.824 | -2.098 | 4.872 |
| 2.758318349851745 | -13.945 | -2.003 | 4.819 |
| 2.764601535158925 | -14.068 | -1.908 | 4.764 |
| 2.770884720466104 | -14.192 | -1.81 | 4.706 |
| 2.777167905773284 | -14.317 | -1.71 | 4.646 |
| 2.783451091080463 | -14.444 | -1.609 | 4.582 |
| 2.789734276387643 | -14.571 | -1.506 | 4.516 |
| 2.796017461694823 | -14.7 | -1.401 | 4.448 |
| 2.802300647002002 | -14.83 | -1.294 | 4.377 |
| 2.808583832309182 | -14.961 | -1.186 | 4.303 |
| 2.814867017616362 | -15.093 | -1.075 | 4.226 |
| 2.821150202923541 | -15.226 | -0.963 | 4.147 |
| 2.827433388230721 | -15.36 | -0.849 | 4.064 |
| 2.833716573537901 | -15.496 | -0.733 | 3.98 |
| 2.83999975884508 | -15.633 | -0.616 | 3.892 |
| 2.84628294415226 | -15.771 | -0.496 | 3.802 |
| 2.852566129459439 | -15.91 | -0.375 | 3.709 |
| 2.858849314766619 | -16.051 | -0.252 | 3.613 |
| 2.865132500073799 | -16.192 | -0.127 | 3.515 |
| 2.871415685380978 | -16.335 | -0.001 | 3.413 |
| 2.877698870688158 | -16.479 | 0.128 | 3.31 |
| 2.883982055995337 | -16.624 | 0.258 | 3.203 |
| 2.890265241302517 | -16.77 | 0.39 | 3.094 |
| 2.896548426609697 | -16.918 | 0.524 | 2.982 |
| 2.902831611916877 | -17.067 | 0.66 | 2.867 |
| 2.909114797224056 | -17.217 | 0.797 | 2.75 |
| 2.915397982531236 | -17.368 | 0.936 | 2.63 |
| 2.921681167838416 | -17.52 | 1.077 | 2.508 |
| 2.927964353145595 | -17.674 | 1.22 | 2.382 |
| 2.934247538452775 | -17.828 | 1.364 | 2.255 |
| 2.940530723759954 | -17.984 | 1.51 | 2.124 |
| 2.946813909067134 | -18.141 | 1.658 | 1.992 |
| 2.953097094374314 | -18.3 | 1.808 | 1.856 |
| 2.959380279681493 | -18.459 | 1.959 | 1.718 |
| 2.965663464988673 | -18.62 | 2.112 | 1.578 |
| 2.971946650295853 | -18.782 | 2.267 | 1.435 |
| 2.978229835603032 | -18.945 | 2.423 | 1.29 |
| 2.984513020910212 | -19.109 | 2.581 | 1.142 |
| 2.990796206217391 | -19.275 | 2.741 | 0.992 |
| 2.997079391524571 | -19.442 | 2.902 | 0.84 |
| 3.003362576831751 | -19.61 | 3.065 | 0.685 |
| 3.009645762138931 | -19.779 | 3.23 | 0.528 |
| 3.01592894744611 | -19.949 | 3.396 | 0.369 |
| 3.02221213275329 | -20.121 | 3.564 | 0.208 |
| 3.028495318060469 | -20.294 | 3.733 | 0.044 |
| 3.034778503367649 | -20.468 | 3.904 | -0.121 |
| 3.041061688674829 | -20.643 | 4.076 | -0.289 |
| 3.047344873982008 | -20.819 | 4.25 | -0.459 |
| 3.053628059289188 | -20.997 | 4.425 | -0.63 |
| 3.059911244596367 | -21.176 | 4.602 | -0.804 |
| 3.066194429903547 | -21.356 | 4.781 | -0.98 |
| 3.072477615210727 | -21.537 | 4.96 | -1.157 |
| 3.078760800517906 | -21.72 | 5.142 | -1.336 |
| 3.085043985825086 | -21.903 | 5.324 | -1.517 |
| 3.091327171132266 | -22.088 | 5.508 | -1.7 |
| 3.097610356439445 | -22.274 | 5.694 | -1.884 |
| 3.103893541746625 | -22.461 | 5.88 | -2.07 |
| 3.110176727053805 | -22.649 | 6.068 | -2.258 |
| 3.116459912360984 | -22.839 | 6.258 | -2.447 |
| 3.122743097668164 | -23.03 | 6.448 | -2.637 |
| 3.129026282975343 | -23.222 | 6.64 | -2.829 |
| 3.135309468282523 | -23.415 | 6.833 | -3.022 |
| 3.141592653589703 | -23.609 | 7.027 | -3.216 |
| 3.147875838896883 | -23.804 | 7.223 | -3.411 |
| 3.154159024204062 | -24.001 | 7.419 | -3.608 |
| 3.160442209511242 | -24.199 | 7.617 | -3.805 |
| 3.166725394818422 | -24.397 | 7.816 | -4.004 |
| 3.173008580125601 | -24.597 | 8.015 | -4.203 |
| 3.179291765432781 | -24.799 | 8.216 | -4.403 |
| 3.18557495073996 | -25.001 | 8.418 | -4.604 |
| 3.19185813604714 | -25.204 | 8.621 | -4.806 |
| 3.19814132135432 | -25.409 | 8.825 | -5.008 |
| 3.2044245066615 | -25.615 | 9.029 | -5.211 |
| 3.210707691968679 | -25.822 | 9.235 | -5.414 |
| 3.216990877275859 | -26.03 | 9.441 | -5.618 |
| 3.223274062583038 | -26.239 | 9.648 | -5.822 |
| 3.229557247890217 | -26.449 | 9.856 | -6.026 |
| 3.235840433197398 | -26.661 | 10.065 | -6.231 |
| 3.242123618504577 | -26.873 | 10.275 | -6.435 |
| 3.248406803811757 | -27.087 | 10.485 | -6.64 |
| 3.254689989118936 | -27.301 | 10.696 | -6.844 |
| 3.260973174426116 | -27.517 | 10.907 | -7.048 |
| 3.267256359733296 | -27.734 | 11.119 | -7.252 |
| 3.273539545040475 | -27.952 | 11.331 | -7.456 |
| 3.279822730347655 | -28.171 | 11.545 | -7.659 |
| 3.286105915654835 | -28.391 | 11.758 | -7.861 |
| 3.292389100962014 | -28.612 | 11.972 | -8.063 |
| 3.298672286269194 | -28.835 | 12.186 | -8.265 |
| 3.304955471576374 | -29.058 | 12.401 | -8.465 |
| 3.311238656883553 | -29.282 | 12.616 | -8.665 |
| 3.317521842190732 | -29.507 | 12.831 | -8.864 |
| 3.323805027497912 | -29.734 | 13.047 | -9.061 |
| 3.330088212805092 | -29.961 | 13.262 | -9.258 |
| 3.336371398112272 | -30.19 | 13.478 | -9.453 |
| 3.342654583419451 | -30.419 | 13.694 | -9.647 |
| 3.34893776872663 | -30.65 | 13.91 | -9.84 |
| 3.355220954033811 | -30.881 | 14.126 | -10.031 |
| 3.36150413934099 | -31.113 | 14.342 | -10.22 |
| 3.36778732464817 | -31.347 | 14.558 | -10.408 |
| 3.37407050995535 | -31.581 | 14.774 | -10.594 |
| 3.380353695262529 | -31.817 | 14.989 | -10.778 |
| 3.386636880569709 | -32.053 | 15.205 | -10.96 |
| 3.392920065876888 | -32.29 | 15.42 | -11.14 |
| 3.399203251184068 | -32.528 | 15.635 | -11.318 |
| 3.405486436491248 | -32.767 | 15.849 | -11.493 |
| 3.411769621798427 | -33.007 | 16.064 | -11.666 |
| 3.418052807105607 | -33.248 | 16.277 | -11.837 |
| 3.424335992412787 | -33.49 | 16.491 | -12.005 |
| 3.430619177719966 | -33.733 | 16.703 | -12.171 |
| 3.436902363027146 | -33.976 | 16.915 | -12.333 |
| 3.443185548334325 | -34.221 | 17.127 | -12.493 |
| 3.449468733641505 | -34.466 | 17.338 | -12.65 |
| 3.455751918948685 | -34.712 | 17.548 | -12.804 |
| 3.462035104255865 | -34.959 | 17.757 | -12.955 |
| 3.468318289563044 | -35.207 | 17.966 | -13.103 |
| 3.474601474870224 | -35.456 | 18.174 | -13.247 |
| 3.480884660177403 | -35.706 | 18.38 | -13.388 |
| 3.487167845484583 | -35.956 | 18.586 | -13.525 |
| 3.493451030791763 | -36.207 | 18.791 | -13.659 |
| 3.499734216098942 | -36.459 | 18.995 | -13.789 |
| 3.506017401406122 | -36.711 | 19.197 | -13.916 |
| 3.512300586713302 | -36.965 | 19.399 | -14.038 |
| 3.518583772020481 | -37.219 | 19.599 | -14.157 |
| 3.524866957327661 | -37.474 | 19.798 | -14.271 |
| 3.531150142634841 | -37.729 | 19.995 | -14.382 |
| 3.53743332794202 | -37.986 | 20.191 | -14.488 |
| 3.5437165132492 | -38.243 | 20.386 | -14.59 |
| 3.54999969855638 | -38.5 | 20.579 | -14.687 |
| 3.556282883863559 | -38.758 | 20.771 | -14.78 |
| 3.562566069170739 | -39.017 | 20.961 | -14.868 |
| 3.568849254477918 | -39.277 | 21.149 | -14.952 |
| 3.575132439785098 | -39.537 | 21.336 | -15.031 |
| 3.581415625092278 | -39.798 | 21.521 | -15.105 |
| 3.587698810399457 | -40.06 | 21.704 | -15.175 |
| 3.593981995706637 | -40.322 | 21.885 | -15.239 |
| 3.600265181013817 | -40.584 | 22.064 | -15.298 |
| 3.606548366320996 | -40.847 | 22.242 | -15.352 |
| 3.612831551628176 | -41.111 | 22.417 | -15.401 |
| 3.619114736935355 | -41.375 | 22.59 | -15.445 |
| 3.625397922242535 | -41.64 | 22.761 | -15.483 |
| 3.631681107549715 | -41.906 | 22.93 | -15.516 |
| 3.637964292856894 | -42.171 | 23.096 | -15.544 |
| 3.644247478164074 | -42.438 | 23.26 | -15.566 |
| 3.650530663471254 | -42.704 | 23.422 | -15.582 |
| 3.656813848778433 | -42.971 | 23.581 | -15.593 |
| 3.663097034085613 | -43.239 | 23.738 | -15.597 |
| 3.669380219392792 | -43.507 | 23.892 | -15.596 |
| 3.675663404699972 | -43.775 | 24.044 | -15.59 |
| 3.681946590007152 | -44.044 | 24.193 | -15.577 |
| 3.688229775314331 | -44.313 | 24.339 | -15.558 |
| 3.694512960621511 | -44.583 | 24.483 | -15.533 |
| 3.700796145928691 | -44.852 | 24.623 | -15.502 |
| 3.70707933123587 | -45.123 | 24.761 | -15.465 |
| 3.71336251654305 | -45.393 | 24.896 | -15.422 |
| 3.71964570185023 | -45.664 | 25.028 | -15.373 |
| 3.72592888715741 | -45.935 | 25.156 | -15.317 |
| 3.732212072464589 | -46.206 | 25.282 | -15.255 |
| 3.738495257771769 | -46.477 | 25.404 | -15.186 |
| 3.744778443078948 | -46.749 | 25.524 | -15.112 |
| 3.751061628386128 | -47.021 | 25.64 | -15.03 |
| 3.757344813693308 | -47.293 | 25.752 | -14.943 |
| 3.763627999000487 | -47.565 | 25.861 | -14.848 |
| 3.769911184307667 | -47.837 | 25.967 | -14.748 |
| 3.776194369614846 | -48.11 | 26.069 | -14.64 |
| 3.782477554922026 | -48.382 | 26.168 | -14.526 |
| 3.788760740229206 | -48.655 | 26.263 | -14.406 |
| 3.795043925536385 | -48.927 | 26.355 | -14.279 |
| 3.801327110843565 | -49.2 | 26.442 | -14.145 |
| 3.807610296150745 | -49.473 | 26.526 | -14.005 |
| 3.813893481457924 | -49.745 | 26.606 | -13.858 |
| 3.820176666765104 | -50.018 | 26.683 | -13.704 |
| 3.826459852072284 | -50.291 | 26.755 | -13.544 |
| 3.832743037379463 | -50.563 | 26.823 | -13.376 |
| 3.839026222686643 | -50.836 | 26.888 | -13.203 |
| 3.845309407993823 | -51.108 | 26.948 | -13.022 |
| 3.851592593301002 | -51.381 | 27.004 | -12.835 |
| 3.857875778608182 | -51.653 | 27.056 | -12.641 |
| 3.864158963915361 | -51.925 | 27.103 | -12.441 |
| 3.870442149222541 | -52.197 | 27.146 | -12.234 |
| 3.876725334529721 | -52.468 | 27.185 | -12.02 |
| 3.8830085198369 | -52.74 | 27.22 | -11.8 |
| 3.88929170514408 | -53.011 | 27.25 | -11.573 |
| 3.89557489045126 | -53.282 | 27.276 | -11.339 |
| 3.901858075758439 | -53.553 | 27.297 | -11.099 |
| 3.908141261065619 | -53.823 | 27.313 | -10.853 |
| 3.914424446372799 | -54.093 | 27.325 | -10.6 |
| 3.920707631679978 | -54.362 | 27.332 | -10.34 |
| 3.926990816987158 | -54.632 | 27.334 | -10.074 |
| 3.933274002294337 | -54.901 | 27.332 | -9.802 |
| 3.939557187601517 | -55.169 | 27.325 | -9.524 |
| 3.945840372908697 | -55.437 | 27.313 | -9.239 |
| 3.952123558215876 | -55.705 | 27.296 | -8.948 |
| 3.958406743523056 | -55.972 | 27.274 | -8.651 |
| 3.964689928830236 | -56.238 | 27.247 | -8.347 |
| 3.970973114137415 | -56.504 | 27.215 | -8.038 |
| 3.977256299444595 | -56.769 | 27.177 | -7.722 |
| 3.983539484751775 | -57.034 | 27.135 | -7.401 |
| 3.989822670058954 | -57.299 | 27.088 | -7.074 |
| 3.996105855366134 | -57.562 | 27.035 | -6.741 |
| 4.002389040673314 | -57.825 | 26.977 | -6.402 |
| 4.008672225980493 | -58.087 | 26.914 | -6.058 |
| 4.014955411287672 | -58.349 | 26.846 | -5.708 |
| 4.021238596594851 | -58.61 | 26.772 | -5.353 |
| 4.02752178190203 | -58.87 | 26.693 | -4.992 |
| 4.03380496720921 | -59.129 | 26.608 | -4.626 |
| 4.040088152516389 | -59.387 | 26.518 | -4.255 |
| 4.046371337823567 | -59.645 | 26.422 | -3.879 |
| 4.052654523130747 | -59.902 | 26.321 | -3.497 |
| 4.058937708437926 | -60.158 | 26.214 | -3.111 |
| 4.065220893745105 | -60.413 | 26.102 | -2.72 |
| 4.071504079052285 | -60.667 | 25.984 | -2.324 |
| 4.077787264359464 | -60.92 | 25.86 | -1.924 |
| 4.084070449666643 | -61.172 | 25.73 | -1.519 |
| 4.090353634973822 | -61.423 | 25.595 | -1.11 |
| 4.096636820281001 | -61.673 | 25.454 | -0.696 |
| 4.102920005588181 | -61.922 | 25.308 | -0.279 |
| 4.10920319089536 | -62.17 | 25.155 | 0.143 |
| 4.115486376202539 | -62.416 | 24.997 | 0.568 |
| 4.121769561509718 | -62.662 | 24.833 | 0.998 |
| 4.128052746816897 | -62.906 | 24.663 | 1.431 |
| 4.134335932124077 | -63.15 | 24.487 | 1.867 |
| 4.140619117431256 | -63.392 | 24.305 | 2.307 |
| 4.146902302738435 | -63.632 | 24.117 | 2.75 |
| 4.153185488045614 | -63.872 | 23.923 | 3.196 |
| 4.159468673352793 | -64.11 | 23.724 | 3.645 |
| 4.165751858659973 | -64.347 | 23.518 | 4.097 |
| 4.172035043967152 | -64.582 | 23.306 | 4.551 |
| 4.178318229274331 | -64.816 | 23.088 | 5.008 |
| 4.18460141458151 | -65.049 | 22.865 | 5.467 |
| 4.190884599888689 | -65.28 | 22.635 | 5.929 |
| 4.197167785195868 | -65.51 | 22.399 | 6.392 |
| 4.203450970503048 | -65.738 | 22.157 | 6.857 |
| 4.209734155810227 | -65.964 | 21.909 | 7.324 |
| 4.216017341117406 | -66.189 | 21.654 | 7.793 |
| 4.222300526424585 | -66.413 | 21.394 | 8.263 |
| 4.228583711731764 | -66.635 | 21.128 | 8.734 |
| 4.234866897038944 | -66.855 | 20.855 | 9.206 |
| 4.241150082346122 | -67.073 | 20.576 | 9.679 |
| 4.247433267653302 | -67.29 | 20.291 | 10.153 |
| 4.253716452960481 | -67.505 | 20.001 | 10.627 |
| 4.25999963826766 | -67.718 | 19.703 | 11.102 |
| 4.26628282357484 | -67.93 | 19.4 | 11.577 |
| 4.272566008882019 | -68.139 | 19.091 | 12.051 |
| 4.278849194189198 | -68.347 | 18.776 | 12.526 |
| 4.285132379496377 | -68.553 | 18.454 | 13 |
| 4.291415564803557 | -68.757 | 18.126 | 13.474 |
| 4.297698750110735 | -68.959 | 17.793 | 13.946 |
| 4.303981935417915 | -69.159 | 17.453 | 14.418 |
| 4.310265120725094 | -69.356 | 17.107 | 14.889 |
| 4.316548306032273 | -69.552 | 16.755 | 15.358 |
| 4.322831491339452 | -69.746 | 16.397 | 15.826 |
| 4.329114676646632 | -69.938 | 16.032 | 16.293 |
| 4.335397861953811 | -70.127 | 15.662 | 16.757 |
| 4.34168104726099 | -70.315 | 15.286 | 17.219 |
| 4.347964232568169 | -70.5 | 14.904 | 17.679 |
| 4.354247417875348 | -70.683 | 14.515 | 18.136 |
| 4.360530603182528 | -70.864 | 14.121 | 18.591 |
| 4.366813788489707 | -71.042 | 13.721 | 19.043 |
| 4.373096973796886 | -71.218 | 13.315 | 19.492 |
| 4.379380159104065 | -71.392 | 12.903 | 19.937 |
| 4.385663344411244 | -71.563 | 12.485 | 20.379 |
| 4.391946529718424 | -71.732 | 12.061 | 20.818 |
| 4.398229715025602 | -71.898 | 11.632 | 21.252 |
| 4.404512900332782 | -72.062 | 11.196 | 21.682 |
| 4.41079608563996 | -72.224 | 10.755 | 22.109 |
| 4.41707927094714 | -72.383 | 10.308 | 22.53 |
| 4.42336245625432 | -72.539 | 9.856 | 22.947 |
| 4.429645641561499 | -72.693 | 9.397 | 23.359 |
| 4.435928826868678 | -72.844 | 8.934 | 23.767 |
| 4.442212012175857 | -72.992 | 8.464 | 24.168 |
| 4.448495197483036 | -73.138 | 7.989 | 24.565 |
| 4.454778382790215 | -73.281 | 7.508 | 24.955 |
| 4.461061568097395 | -73.421 | 7.022 | 25.34 |
| 4.467344753404574 | -73.558 | 6.531 | 25.719 |
| 4.473627938711753 | -73.692 | 6.034 | 26.092 |
| 4.479911124018932 | -73.824 | 5.531 | 26.458 |
| 4.486194309326112 | -73.953 | 5.024 | 26.817 |
| 4.49247749463329 | -74.079 | 4.511 | 27.17 |
| 4.49876067994047 | -74.201 | 3.993 | 27.515 |
| 4.50504386524765 | -74.321 | 3.47 | 27.854 |
| 4.511327050554828 | -74.438 | 2.941 | 28.185 |
| 4.517610235862008 | -74.552 | 2.408 | 28.508 |
| 4.523893421169186 | -74.662 | 1.87 | 28.824 |
| 4.530176606476366 | -74.77 | 1.326 | 29.132 |
| 4.536459791783545 | -74.874 | 0.778 | 29.431 |
| 4.542742977090724 | -74.975 | 0.225 | 29.722 |
| 4.549026162397904 | -75.073 | -0.333 | 30.005 |
| 4.555309347705083 | -75.167 | -0.895 | 30.279 |
| 4.561592533012262 | -75.258 | -1.463 | 30.544 |
| 4.567875718319441 | -75.346 | -2.034 | 30.801 |
| 4.57415890362662 | -75.431 | -2.611 | 31.047 |
| 4.5804420889338 | -75.512 | -3.191 | 31.285 |
| 4.586725274240979 | -75.59 | -3.776 | 31.513 |
| 4.593008459548158 | -75.664 | -4.366 | 31.731 |
| 4.599291644855337 | -75.735 | -4.959 | 31.94 |
| 4.605574830162516 | -75.802 | -5.557 | 32.138 |
| 4.611858015469695 | -75.866 | -6.159 | 32.326 |
| 4.618141200776875 | -75.926 | -6.765 | 32.504 |
| 4.624424386084054 | -75.982 | -7.375 | 32.672 |
| 4.630707571391233 | -76.035 | -7.988 | 32.828 |
| 4.636990756698412 | -76.084 | -8.606 | 32.974 |
| 4.643273942005591 | -76.129 | -9.227 | 33.109 |
| 4.649557127312771 | -76.171 | -9.852 | 33.233 |
| 4.65584031261995 | -76.209 | -10.48 | 33.346 |
| 4.66212349792713 | -76.242 | -11.112 | 33.447 |
| 4.668406683234308 | -76.273 | -11.747 | 33.537 |
| 4.674689868541487 | -76.299 | -12.386 | 33.616 |
| 4.680973053848666 | -76.321 | -13.027 | 33.682 |
| 4.687256239155846 | -76.339 | -13.672 | 33.737 |
| 4.693539424463024 | -76.353 | -14.32 | 33.78 |
| 4.699822609770204 | -76.364 | -14.97 | 33.81 |
| 4.706105795077383 | -76.37 | -15.624 | 33.829 |
| 4.712388980384562 | -76.372 | -16.28 | 33.835 |
| 4.718672165691741 | -76.37 | -16.939 | 33.829 |
| 4.724955350998921 | -76.364 | -17.6 | 33.81 |
| 4.7312385363061 | -76.353 | -18.264 | 33.779 |
| 4.73752172161328 | -76.338 | -18.93 | 33.735 |
| 4.743804906920459 | -76.32 | -19.598 | 33.678 |
| 4.750088092227637 | -76.296 | -20.269 | 33.608 |
| 4.756371277534817 | -76.269 | -20.941 | 33.526 |
| 4.762654462841996 | -76.237 | -21.616 | 33.431 |
| 4.768937648149175 | -76.201 | -22.292 | 33.322 |
| 4.775220833456354 | -76.16 | -22.97 | 33.2 |
| 4.781504018763534 | -76.115 | -23.649 | 33.066 |
| 4.787787204070713 | -76.065 | -24.331 | 32.918 |
| 4.794070389377892 | -76.011 | -25.013 | 32.756 |
| 4.800353574685071 | -75.952 | -25.697 | 32.582 |
| 4.806636759992251 | -75.889 | -26.382 | 32.394 |
| 4.81291994529943 | -75.821 | -27.067 | 32.192 |
| 4.819203130606608 | -75.748 | -27.754 | 31.978 |
| 4.825486315913788 | -75.671 | -28.442 | 31.749 |
| 4.831769501220967 | -75.589 | -29.13 | 31.508 |
| 4.838052686528146 | -75.502 | -29.819 | 31.252 |
| 4.844335871835326 | -75.41 | -30.509 | 30.984 |
| 4.850619057142505 | -75.314 | -31.198 | 30.702 |
| 4.856902242449684 | -75.213 | -31.888 | 30.406 |
| 4.863185427756863 | -75.106 | -32.578 | 30.097 |
| 4.869468613064042 | -74.995 | -33.268 | 29.774 |
| 4.875751798371221 | -74.879 | -33.958 | 29.438 |
| 4.882034983678401 | -74.759 | -34.648 | 29.088 |
| 4.88831816898558 | -74.633 | -35.337 | 28.726 |
| 4.894601354292759 | -74.502 | -36.026 | 28.349 |
| 4.900884539599939 | -74.366 | -36.714 | 27.96 |
| 4.907167724907117 | -74.224 | -37.401 | 27.557 |
| 4.913450910214297 | -74.078 | -38.087 | 27.14 |
| 4.919734095521476 | -73.927 | -38.773 | 26.711 |
| 4.926017280828655 | -73.77 | -39.457 | 26.269 |
| 4.932300466135834 | -73.608 | -40.14 | 25.813 |
| 4.938583651443014 | -73.441 | -40.821 | 25.344 |
| 4.944866836750193 | -73.269 | -41.501 | 24.863 |
| 4.951150022057372 | -73.091 | -42.179 | 24.369 |
| 4.957433207364551 | -72.908 | -42.856 | 23.862 |
| 4.96371639267173 | -72.72 | -43.53 | 23.342 |
| 4.96999957797891 | -72.526 | -44.202 | 22.81 |
| 4.976282763286088 | -72.327 | -44.872 | 22.265 |
| 4.982565948593268 | -72.122 | -45.54 | 21.708 |
| 4.988849133900447 | -71.912 | -46.205 | 21.138 |
| 4.995132319207626 | -71.696 | -46.868 | 20.557 |
| 5.001415504514805 | -71.475 | -47.528 | 19.964 |
| 5.007698689821984 | -71.248 | -48.184 | 19.358 |
| 5.013981875129164 | -71.016 | -48.838 | 18.741 |
| 5.020265060436343 | -70.777 | -49.489 | 18.113 |
| 5.026548245743522 | -70.534 | -50.136 | 17.473 |
| 5.032831431050702 | -70.284 | -50.78 | 16.822 |
| 5.039114616357881 | -70.029 | -51.42 | 16.16 |
| 5.04539780166506 | -69.768 | -52.057 | 15.486 |
| 5.05168098697224 | -69.501 | -52.689 | 14.802 |
| 5.057964172279418 | -69.229 | -53.318 | 14.108 |
| 5.064247357586598 | -68.951 | -53.942 | 13.403 |
| 5.070530542893777 | -68.666 | -54.562 | 12.688 |
| 5.076813728200956 | -68.376 | -55.178 | 11.962 |
| 5.083096913508135 | -68.08 | -55.789 | 11.227 |
| 5.089380098815314 | -67.778 | -56.395 | 10.483 |
| 5.095663284122493 | -67.471 | -56.996 | 9.728 |
| 5.101946469429673 | -67.157 | -57.592 | 8.965 |
| 5.108229654736852 | -66.837 | -58.183 | 8.193 |
| 5.114512840044031 | -66.511 | -58.769 | 7.412 |
| 5.12079602535121 | -66.179 | -59.35 | 6.622 |
| 5.12707921065839 | -65.841 | -59.924 | 5.824 |
| 5.133362395965568 | -65.496 | -60.493 | 5.018 |
| 5.139645581272747 | -65.146 | -61.056 | 4.204 |
| 5.145928766579927 | -64.789 | -61.614 | 3.383 |
| 5.152211951887106 | -64.427 | -62.164 | 2.554 |
| 5.158495137194286 | -64.058 | -62.709 | 1.718 |
| 5.164778322501465 | -63.682 | -63.247 | 0.876 |
| 5.171061507808644 | -63.301 | -63.779 | 0.026 |
| 5.177344693115823 | -62.913 | -64.303 | -0.829 |
| 5.183627878423002 | -62.519 | -64.821 | -1.69 |
| 5.189911063730181 | -62.118 | -65.332 | -2.558 |
| 5.196194249037361 | -61.712 | -65.836 | -3.43 |
| 5.20247743434454 | -61.298 | -66.332 | -4.308 |
| 5.20876061965172 | -60.879 | -66.821 | -5.191 |
| 5.215043804958898 | -60.453 | -67.303 | -6.078 |
| 5.221326990266077 | -60.02 | -67.776 | -6.969 |
| 5.227610175573257 | -59.581 | -68.242 | -7.865 |
| 5.233893360880435 | -59.135 | -68.7 | -8.764 |
| 5.240176546187615 | -58.683 | -69.149 | -9.666 |
| 5.246459731494794 | -58.225 | -69.591 | -10.572 |
| 5.252742916801973 | -57.76 | -70.023 | -11.48 |
| 5.259026102109152 | -57.288 | -70.448 | -12.391 |
| 5.265309287416332 | -56.81 | -70.863 | -13.303 |
| 5.27159247272351 | -56.325 | -71.27 | -14.218 |
| 5.27787565803069 | -55.833 | -71.668 | -15.134 |
| 5.284158843337869 | -55.335 | -72.057 | -16.051 |
| 5.290442028645049 | -54.83 | -72.436 | -16.968 |
| 5.296725213952227 | -54.318 | -72.806 | -17.887 |
| 5.303008399259407 | -53.799 | -73.167 | -18.805 |
| 5.309291584566586 | -53.274 | -73.518 | -19.723 |
| 5.315574769873765 | -52.742 | -73.859 | -20.64 |
| 5.321857955180945 | -52.204 | -74.191 | -21.557 |
| 5.328141140488124 | -51.658 | -74.512 | -22.472 |
| 5.334424325795303 | -51.106 | -74.823 | -23.385 |
| 5.340707511102482 | -50.547 | -75.124 | -24.296 |
| 5.346990696409661 | -49.981 | -75.415 | -25.205 |
| 5.35327388171684 | -49.408 | -75.695 | -26.112 |
| 5.35955706702402 | -48.828 | -75.964 | -27.015 |
| 5.365840252331199 | -48.241 | -76.223 | -27.915 |
| 5.372123437638378 | -47.648 | -76.471 | -28.811 |
| 5.378406622945557 | -47.047 | -76.707 | -29.703 |
| 5.384689808252737 | -46.44 | -76.933 | -30.59 |
| 5.390972993559916 | -45.825 | -77.147 | -31.473 |
| 5.397256178867095 | -45.204 | -77.35 | -32.35 |
| 5.403539364174274 | -44.575 | -77.542 | -33.222 |
| 5.409822549481453 | -43.94 | -77.722 | -34.087 |
| 5.416105734788632 | -43.298 | -77.89 | -34.946 |
| 5.422388920095812 | -42.648 | -78.046 | -35.799 |
| 5.42867210540299 | -41.992 | -78.191 | -36.645 |
| 5.43495529071017 | -41.328 | -78.323 | -37.483 |
| 5.44123847601735 | -40.658 | -78.444 | -38.313 |
| 5.447521661324528 | -39.98 | -78.552 | -39.135 |
| 5.453804846631708 | -39.295 | -78.648 | -39.949 |
| 5.460088031938887 | -38.603 | -78.731 | -40.754 |
| 5.466371217246066 | -37.904 | -78.802 | -41.549 |
| 5.472654402553245 | -37.198 | -78.86 | -42.335 |
| 5.478937587860424 | -36.485 | -78.905 | -43.111 |
| 5.485220773167603 | -35.764 | -78.938 | -43.877 |
| 5.491503958474783 | -35.037 | -78.957 | -44.632 |
| 5.497787143781962 | -34.302 | -78.964 | -45.376 |
| 5.504070329089141 | -33.56 | -78.957 | -46.108 |
| 5.51035351439632 | -32.811 | -78.937 | -46.829 |
| 5.5166366997035 | -32.055 | -78.904 | -47.538 |
| 5.522919885010679 | -31.292 | -78.858 | -48.234 |
| 5.529203070317858 | -30.521 | -78.798 | -48.918 |
| 5.535486255625037 | -29.743 | -78.724 | -49.588 |
| 5.541769440932216 | -28.958 | -78.637 | -50.245 |
| 5.548052626239396 | -28.166 | -78.537 | -50.888 |
| 5.554335811546575 | -27.366 | -78.422 | -51.517 |
| 5.560618996853754 | -26.559 | -78.294 | -52.132 |
| 5.566902182160933 | -25.745 | -78.151 | -52.731 |
| 5.573185367468112 | -24.924 | -77.995 | -53.316 |
| 5.579468552775292 | -24.096 | -77.824 | -53.885 |
| 5.585751738082471 | -23.26 | -77.64 | -54.439 |
| 5.59203492338965 | -22.417 | -77.441 | -54.976 |
| 5.59831810869683 | -21.567 | -77.228 | -55.497 |
| 5.604601294004008 | -20.709 | -77.001 | -56.002 |
| 5.610884479311188 | -19.845 | -76.759 | -56.489 |
| 5.617167664618367 | -18.973 | -76.503 | -56.959 |
| 5.623450849925546 | -18.094 | -76.232 | -57.412 |
| 5.629734035232725 | -17.207 | -75.947 | -57.847 |
| 5.636017220539904 | -16.313 | -75.647 | -58.263 |
| 5.642300405847083 | -15.412 | -75.333 | -58.662 |
| 5.648583591154263 | -14.504 | -75.004 | -59.041 |
| 5.654866776461442 | -13.588 | -74.66 | -59.402 |
| 5.661149961768621 | -12.666 | -74.302 | -59.743 |
| 5.6674331470758 | -11.735 | -73.928 | -60.065 |
| 5.673716332382979 | -10.798 | -73.54 | -60.368 |
| 5.679999517690159 | -9.854 | -73.137 | -60.65 |
| 5.686282702997337 | -8.902 | -72.72 | -60.912 |
| 5.692565888304517 | -7.943 | -72.287 | -61.154 |
| 5.698849073611696 | -6.976 | -71.839 | -61.375 |
| 5.705132258918875 | -6.003 | -71.377 | -61.575 |
| 5.711415444226055 | -5.022 | -70.899 | -61.755 |
| 5.717698629533234 | -4.034 | -70.407 | -61.912 |
| 5.723981814840413 | -3.039 | -69.899 | -62.049 |
| 5.730265000147592 | -2.036 | -69.376 | -62.164 |
| 5.73654818545477 | -1.026 | -68.839 | -62.257 |
| 5.742831370761951 | -0.01 | -68.286 | -62.327 |
| 5.74911455606913 | 1.014 | -67.718 | -62.376 |
| 5.75539774137631 | 2.046 | -67.136 | -62.402 |
| 5.761680926683488 | 3.084 | -66.538 | -62.406 |
| 5.767964111990667 | 4.13 | -65.925 | -62.387 |
| 5.774247297297846 | 5.183 | -65.297 | -62.345 |
| 5.780530482605025 | 6.243 | -64.655 | -62.281 |
| 5.786813667912205 | 7.31 | -63.997 | -62.193 |
| 5.793096853219384 | 8.384 | -63.324 | -62.082 |
| 5.799380038526563 | 9.465 | -62.636 | -61.948 |
| 5.805663223833742 | 10.554 | -61.934 | -61.79 |
| 5.811946409140922 | 11.649 | -61.216 | -61.609 |
| 5.8182295944481 | 12.752 | -60.484 | -61.404 |
| 5.82451277975528 | 13.861 | -59.736 | -61.176 |
| 5.830795965062459 | 14.978 | -58.974 | -60.924 |
| 5.837079150369638 | 16.102 | -58.197 | -60.648 |
| 5.843362335676817 | 17.233 | -57.405 | -60.348 |
| 5.849645520983997 | 18.371 | -56.599 | -60.024 |
| 5.855928706291176 | 19.515 | -55.778 | -59.676 |
| 5.862211891598355 | 20.667 | -54.942 | -59.305 |
| 5.868495076905535 | 21.826 | -54.092 | -58.909 |
| 5.874778262212714 | 22.992 | -53.227 | -58.49 |
| 5.881061447519893 | 24.164 | -52.348 | -58.046 |
| 5.887344632827072 | 25.344 | -51.454 | -57.579 |
| 5.893627818134251 | 26.53 | -50.546 | -57.087 |
| 5.899911003441431 | 27.724 | -49.624 | -56.572 |
| 5.90619418874861 | 28.924 | -48.687 | -56.033 |
| 5.912477374055789 | 30.131 | -47.736 | -55.47 |
| 5.918760559362968 | 31.345 | -46.771 | -54.883 |
| 5.925043744670147 | 32.565 | -45.793 | -54.272 |
| 5.931326929977326 | 33.793 | -44.8 | -53.638 |
| 5.937610115284505 | 35.027 | -43.793 | -52.98 |
| 5.943893300591684 | 36.268 | -42.773 | -52.299 |
| 5.950176485898864 | 37.515 | -41.739 | -51.594 |
| 5.956459671206043 | 38.769 | -40.692 | -50.866 |
| 5.962742856513223 | 40.03 | -39.631 | -50.115 |
| 5.969026041820402 | 41.298 | -38.556 | -49.341 |
| 5.975309227127581 | 42.572 | -37.469 | -48.545 |
| 5.98159241243476 | 43.853 | -36.368 | -47.725 |
| 5.987875597741939 | 45.14 | -35.254 | -46.883 |
| 5.994158783049118 | 46.434 | -34.127 | -46.018 |
| 6.000441968356298 | 47.734 | -32.987 | -45.132 |
| 6.006725153663476 | 49.041 | -31.835 | -44.223 |
| 6.013008338970656 | 50.354 | -30.669 | -43.293 |
| 6.019291524277835 | 51.674 | -29.492 | -42.34 |
| 6.025574709585015 | 53 | -28.302 | -41.367 |
| 6.031857894892193 | 54.332 | -27.1 | -40.372 |
| 6.038141080199372 | 55.671 | -25.885 | -39.357 |
| 6.044424265506552 | 57.016 | -24.659 | -38.32 |
| 6.050707450813731 | 58.368 | -23.421 | -37.264 |
| 6.05699063612091 | 59.725 | -22.171 | -36.187 |
| 6.06327382142809 | 61.089 | -20.909 | -35.09 |
| 6.069557006735269 | 62.459 | -19.636 | -33.974 |
| 6.075840192042448 | 63.835 | -18.352 | -32.838 |
| 6.082123377349627 | 65.217 | -17.057 | -31.683 |
| 6.088406562656806 | 66.605 | -15.75 | -30.51 |
| 6.094689747963986 | 67.999 | -14.433 | -29.318 |
| 6.100972933271164 | 69.4 | -13.105 | -28.108 |
| 6.107256118578344 | 70.806 | -11.767 | -26.88 |
| 6.113539303885523 | 72.218 | -10.418 | -25.635 |
| 6.119822489192702 | 73.636 | -9.059 | -24.373 |
| 6.126105674499882 | 75.06 | -7.69 | -23.094 |
| 6.132388859807061 | 76.489 | -6.312 | -21.798 |
| 6.13867204511424 | 77.925 | -4.923 | -20.487 |
| 6.144955230421419 | 79.366 | -3.525 | -19.161 |
| 6.151238415728598 | 80.813 | -2.118 | -17.819 |
| 6.157521601035778 | 82.265 | -0.702 | -16.462 |
| 6.163804786342957 | 83.724 | 0.724 | -15.091 |
| 6.170087971650136 | 85.187 | 2.157 | -13.706 |
| 6.176371156957315 | 86.656 | 3.6 | -12.308 |
| 6.182654342264494 | 88.131 | 5.051 | -10.896 |
| 6.188937527571674 | 89.611 | 6.51 | -9.472 |
| 6.195220712878853 | 91.097 | 7.977 | -8.036 |
| 6.201503898186032 | 92.588 | 9.452 | -6.588 |
| 6.207787083493211 | 94.084 | 10.934 | -5.128 |
| 6.21407026880039 | 95.585 | 12.424 | -3.658 |
| 6.22035345410757 | 97.092 | 13.921 | -2.178 |
| 6.226636639414749 | 98.604 | 15.424 | -0.687 |
| 6.232919824721928 | 100.121 | 16.935 | 0.812 |
| 6.239203010029107 | 101.643 | 18.452 | 2.321 |
| 6.245486195336286 | 103.17 | 19.975 | 3.838 |
| 6.251769380643465 | 104.702 | 21.504 | 5.362 |
| 6.258052565950644 | 106.239 | 23.04 | 6.894 |
| 6.264335751257824 | 107.781 | 24.58 | 8.433 |
| 6.270618936565003 | 109.328 | 26.126 | 9.978 |
| 6.276902121872182 | 110.879 | 27.678 | 11.529 |
| 6.283185307179361 | 112.435 | 29.234 | 13.085 |